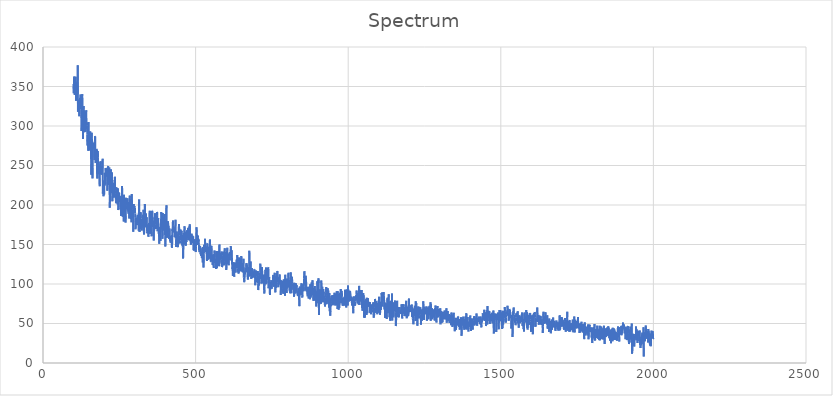
| Category | Spectrum |
|---|---|
| 100.0 | 353.303 |
| 100.69167 | 341.52 |
| 101.38332 | 352.706 |
| 102.07499 | 362.656 |
| 102.76665 | 359.975 |
| 103.45832 | 347.76 |
| 104.14998 | 339.118 |
| 104.84164 | 349.509 |
| 105.53331 | 344.455 |
| 106.22498 | 345.254 |
| 106.91663 | 362.371 |
| 107.6083 | 357.307 |
| 108.29996 | 332.029 |
| 108.99163 | 354.724 |
| 109.68329 | 350.993 |
| 110.37495 | 346.092 |
| 111.06662 | 334.227 |
| 111.75829 | 342.522 |
| 112.44994 | 355.338 |
| 113.14161 | 340.088 |
| 113.83327 | 376.787 |
| 114.52493 | 317.921 |
| 115.2166 | 326.232 |
| 115.90826 | 329.995 |
| 116.59993 | 324.362 |
| 117.29159 | 332.175 |
| 117.98325 | 332.549 |
| 118.67492 | 312.316 |
| 119.36658 | 332.996 |
| 120.05824 | 333.973 |
| 120.74991 | 332.07 |
| 121.44157 | 335.581 |
| 122.13324 | 321.367 |
| 122.8249 | 339.925 |
| 123.51656 | 328.042 |
| 124.20823 | 332.944 |
| 124.89989 | 332.349 |
| 125.59155 | 314.992 |
| 126.28322 | 293.777 |
| 126.97488 | 303.907 |
| 127.66654 | 330.435 |
| 128.35822 | 340.341 |
| 129.04987 | 335.418 |
| 129.74153 | 319.316 |
| 130.4332 | 298.427 |
| 131.12486 | 283.562 |
| 131.81653 | 304.707 |
| 132.50819 | 317.986 |
| 133.19986 | 325.163 |
| 133.89153 | 320.893 |
| 134.58318 | 305.581 |
| 135.27484 | 292.055 |
| 135.96651 | 313.554 |
| 136.65817 | 304.524 |
| 137.34984 | 315.692 |
| 138.0415 | 317.598 |
| 138.73317 | 304.889 |
| 139.42482 | 292.693 |
| 140.11649 | 303.266 |
| 140.80815 | 312.949 |
| 141.49982 | 320.042 |
| 142.19148 | 309.09 |
| 142.88315 | 302.558 |
| 143.57481 | 304.409 |
| 144.26648 | 301.077 |
| 144.95813 | 289.692 |
| 145.6498 | 275.315 |
| 146.34146 | 284.23 |
| 147.03313 | 288.501 |
| 147.72479 | 275.934 |
| 148.41646 | 268.559 |
| 149.10812 | 305.114 |
| 149.79977 | 277.972 |
| 150.49144 | 269.382 |
| 151.18311 | 279.645 |
| 151.87477 | 283.037 |
| 152.56644 | 284.113 |
| 153.2581 | 292.775 |
| 153.94977 | 276.847 |
| 154.64143 | 292.975 |
| 155.33308 | 283.051 |
| 156.02475 | 268.773 |
| 156.71642 | 271.012 |
| 157.40808 | 271.835 |
| 158.09975 | 238.405 |
| 158.79141 | 260.489 |
| 159.48308 | 291.464 |
| 160.17474 | 284.385 |
| 160.86639 | 273.737 |
| 161.55806 | 253.786 |
| 162.24973 | 233.705 |
| 162.94139 | 272.681 |
| 163.63306 | 274.381 |
| 164.32472 | 277.166 |
| 165.01639 | 278.952 |
| 165.70804 | 275.189 |
| 166.3997 | 271.54 |
| 167.09137 | 274.614 |
| 167.78304 | 272.403 |
| 168.4747 | 257.09 |
| 169.16637 | 273.044 |
| 169.85803 | 280.006 |
| 170.5497 | 287.171 |
| 171.24135 | 286.665 |
| 171.93301 | 254.77 |
| 172.62468 | 253.066 |
| 173.31635 | 271.008 |
| 174.00801 | 267.34 |
| 174.69968 | 260.438 |
| 175.39134 | 262.046 |
| 176.08299 | 270.467 |
| 176.77466 | 270.267 |
| 177.46632 | 233.635 |
| 178.15799 | 243.855 |
| 178.84966 | 261.515 |
| 179.54132 | 268.319 |
| 180.23299 | 260.422 |
| 180.92465 | 245.741 |
| 181.6163 | 238.806 |
| 182.30797 | 254.654 |
| 182.99963 | 250.144 |
| 183.6913 | 241.714 |
| 184.38297 | 236.656 |
| 185.07463 | 230.942 |
| 185.7663 | 223.869 |
| 186.45795 | 241.182 |
| 187.14961 | 251.051 |
| 187.84128 | 239.566 |
| 188.53294 | 250.13 |
| 189.22461 | 255.297 |
| 189.91628 | 246.716 |
| 190.60794 | 245.174 |
| 191.29961 | 240.051 |
| 191.99126 | 245.925 |
| 192.68292 | 238.29 |
| 193.37459 | 241.778 |
| 194.06625 | 244.702 |
| 194.75792 | 246.91 |
| 195.44958 | 258.45 |
| 196.14125 | 214.389 |
| 196.8329 | 230.401 |
| 197.52457 | 222.381 |
| 198.21623 | 211.073 |
| 198.9079 | 215.067 |
| 199.59956 | 224.515 |
| 200.29123 | 213.19 |
| 200.98289 | 231.169 |
| 201.67456 | 224.306 |
| 202.36621 | 240.705 |
| 203.05788 | 237.134 |
| 203.74954 | 226 |
| 204.44121 | 231.036 |
| 205.13287 | 246.959 |
| 205.82454 | 246.588 |
| 206.5162 | 236.062 |
| 207.20787 | 236.889 |
| 207.89952 | 244.298 |
| 208.59119 | 246.546 |
| 209.28285 | 242.973 |
| 209.97452 | 244.732 |
| 210.66618 | 218.182 |
| 211.35785 | 222.205 |
| 212.04951 | 238.441 |
| 212.74117 | 249.121 |
| 213.43283 | 249.358 |
| 214.1245 | 240.064 |
| 214.81616 | 225.343 |
| 215.50783 | 237.843 |
| 216.19949 | 226.454 |
| 216.89116 | 247.53 |
| 217.58282 | 244.371 |
| 218.27448 | 213.757 |
| 218.96614 | 196.404 |
| 219.65781 | 226.33 |
| 220.34947 | 215.55 |
| 221.04114 | 223.15 |
| 221.7328 | 240.503 |
| 222.42447 | 245.107 |
| 223.11612 | 242.176 |
| 223.80779 | 239.314 |
| 224.49945 | 232.239 |
| 225.19112 | 229.663 |
| 225.88278 | 241.151 |
| 226.57445 | 211.961 |
| 227.26611 | 204.667 |
| 227.95778 | 210.973 |
| 228.64943 | 216.193 |
| 229.34109 | 227.37 |
| 230.03276 | 216.189 |
| 230.72443 | 227.825 |
| 231.41609 | 227.886 |
| 232.10776 | 211.495 |
| 232.79942 | 209.358 |
| 233.49107 | 225.14 |
| 234.18274 | 231.339 |
| 234.8744 | 230.043 |
| 235.56607 | 235.696 |
| 236.25774 | 218.674 |
| 236.9494 | 214.102 |
| 237.64107 | 211.963 |
| 238.33273 | 207.256 |
| 239.02438 | 205.707 |
| 239.71605 | 202.35 |
| 240.40771 | 222.538 |
| 241.09938 | 208.355 |
| 241.79105 | 205.824 |
| 242.48271 | 203.934 |
| 243.17438 | 204.982 |
| 243.86604 | 211.395 |
| 244.55769 | 200.559 |
| 245.24936 | 221.252 |
| 245.94102 | 212.395 |
| 246.63269 | 193.553 |
| 247.32436 | 197.344 |
| 248.01602 | 206.575 |
| 248.70769 | 205.786 |
| 249.39934 | 215.693 |
| 250.091 | 213.104 |
| 250.78267 | 209.329 |
| 251.47433 | 207.484 |
| 252.166 | 203.434 |
| 252.85767 | 207.849 |
| 253.54933 | 210.975 |
| 254.241 | 194.444 |
| 254.93265 | 202.845 |
| 255.62431 | 186.062 |
| 256.31598 | 210.04 |
| 257.00766 | 199.794 |
| 257.69931 | 192.588 |
| 258.39096 | 208.4 |
| 259.08264 | 224.164 |
| 259.77429 | 213.311 |
| 260.46597 | 202.565 |
| 261.15762 | 185.1 |
| 261.8493 | 193.82 |
| 262.54095 | 202.028 |
| 263.2326 | 204.896 |
| 263.92429 | 199.952 |
| 264.61594 | 179.242 |
| 265.30762 | 212.975 |
| 265.99927 | 195.183 |
| 266.69095 | 191.168 |
| 267.3826 | 198.4 |
| 268.07425 | 201.389 |
| 268.76593 | 200.581 |
| 269.45758 | 201.731 |
| 270.14926 | 177.711 |
| 270.84091 | 181.549 |
| 271.53259 | 209.173 |
| 272.22424 | 206.845 |
| 272.91589 | 204.545 |
| 273.60757 | 205.818 |
| 274.29922 | 199.524 |
| 274.99091 | 194.704 |
| 275.68256 | 195.946 |
| 276.37424 | 208.446 |
| 277.06589 | 199.554 |
| 277.75757 | 193.121 |
| 278.44922 | 200.18 |
| 279.14087 | 203.716 |
| 279.83255 | 188.95 |
| 280.5242 | 200.664 |
| 281.21588 | 191.606 |
| 281.90753 | 195.507 |
| 282.59921 | 183.025 |
| 283.29086 | 195.131 |
| 283.98251 | 211.868 |
| 284.67419 | 200.932 |
| 285.36584 | 184.605 |
| 286.05753 | 197.638 |
| 286.74918 | 207.282 |
| 287.44086 | 193.742 |
| 288.13251 | 182.011 |
| 288.82416 | 182.045 |
| 289.51584 | 181.453 |
| 290.20749 | 178.083 |
| 290.89917 | 213.881 |
| 291.59082 | 196.508 |
| 292.2825 | 195 |
| 292.97415 | 194.337 |
| 293.6658 | 185.243 |
| 294.35748 | 188.03 |
| 295.04913 | 192.421 |
| 295.74081 | 166.177 |
| 296.43246 | 188.169 |
| 297.12415 | 201.225 |
| 297.8158 | 194.735 |
| 298.50748 | 190.488 |
| 299.19913 | 196.665 |
| 299.89078 | 198.775 |
| 300.58246 | 191.296 |
| 301.27411 | 196.178 |
| 301.96579 | 189.209 |
| 302.65744 | 184.414 |
| 303.34912 | 169.264 |
| 304.04077 | 177.059 |
| 304.73242 | 184.02 |
| 305.4241 | 180.343 |
| 306.11575 | 179.913 |
| 306.80743 | 182.89 |
| 307.49908 | 174.549 |
| 308.19077 | 176.906 |
| 308.88242 | 184.426 |
| 309.57407 | 187.567 |
| 310.26575 | 187.323 |
| 310.9574 | 186.094 |
| 311.64908 | 182.785 |
| 312.34073 | 177.211 |
| 313.03241 | 181.197 |
| 313.72406 | 167.335 |
| 314.41574 | 204.026 |
| 315.10739 | 207.104 |
| 315.79904 | 180.963 |
| 316.49072 | 165.844 |
| 317.18237 | 168.772 |
| 317.87405 | 173.556 |
| 318.5657 | 191.025 |
| 319.25739 | 183.714 |
| 319.94904 | 190.428 |
| 320.64069 | 183.585 |
| 321.33237 | 169.975 |
| 322.02402 | 169.914 |
| 322.7157 | 178.714 |
| 323.40735 | 167.77 |
| 324.09903 | 179.135 |
| 324.79068 | 178.605 |
| 325.48233 | 173.254 |
| 326.17401 | 173.646 |
| 326.86566 | 181 |
| 327.55734 | 187.738 |
| 328.24899 | 184.765 |
| 328.94067 | 170.855 |
| 329.63232 | 193.984 |
| 330.32397 | 166.991 |
| 331.01566 | 162.657 |
| 331.70731 | 165.789 |
| 332.39899 | 174.731 |
| 333.09064 | 192.502 |
| 333.78232 | 201.36 |
| 334.47397 | 187.587 |
| 335.16565 | 188.842 |
| 335.8573 | 171.833 |
| 336.54895 | 182.856 |
| 337.24063 | 189.196 |
| 337.93228 | 182.03 |
| 338.62396 | 176.611 |
| 339.31561 | 181.579 |
| 340.00729 | 184.552 |
| 340.69894 | 166.144 |
| 341.39059 | 164.439 |
| 342.08228 | 164.198 |
| 342.77393 | 169.817 |
| 343.46561 | 175.406 |
| 344.15726 | 172.317 |
| 344.84894 | 162.358 |
| 345.54059 | 159.754 |
| 346.23224 | 177.301 |
| 346.92392 | 168.355 |
| 347.61557 | 168.917 |
| 348.30725 | 171.899 |
| 348.9989 | 187.279 |
| 349.69058 | 192.751 |
| 350.38223 | 163.536 |
| 351.07391 | 175.711 |
| 351.76556 | 186.261 |
| 352.45721 | 192.363 |
| 353.1489 | 181.358 |
| 353.84055 | 190.335 |
| 354.53223 | 185.182 |
| 355.22388 | 162.221 |
| 355.91556 | 160.433 |
| 356.60721 | 183.498 |
| 357.29886 | 192.668 |
| 357.99054 | 192.633 |
| 358.68219 | 190.703 |
| 359.37387 | 177.891 |
| 360.06552 | 172.217 |
| 360.7572 | 176.029 |
| 361.44885 | 179.652 |
| 362.1405 | 179.516 |
| 362.83218 | 155.078 |
| 363.52383 | 171.814 |
| 364.21552 | 167.88 |
| 364.90717 | 183.414 |
| 365.59885 | 184.362 |
| 366.2905 | 182.433 |
| 366.98215 | 189.566 |
| 367.67383 | 184.829 |
| 368.36548 | 179.244 |
| 369.05716 | 183.647 |
| 369.74881 | 175.55 |
| 370.44049 | 169.717 |
| 371.13214 | 172.907 |
| 371.82382 | 178.125 |
| 372.51547 | 183.688 |
| 373.20712 | 191.123 |
| 373.8988 | 191.074 |
| 374.59045 | 186.662 |
| 375.28214 | 166.73 |
| 375.97379 | 168.782 |
| 376.66547 | 179.615 |
| 377.35712 | 183.474 |
| 378.04877 | 177.699 |
| 378.74045 | 168.537 |
| 379.4321 | 163.559 |
| 380.12378 | 171.102 |
| 380.81543 | 150.81 |
| 381.50711 | 166.701 |
| 382.19876 | 166.876 |
| 382.89041 | 171.846 |
| 383.58209 | 172.01 |
| 384.27374 | 161.476 |
| 384.96542 | 154.551 |
| 385.65707 | 163.327 |
| 386.34875 | 178.356 |
| 387.04041 | 183.303 |
| 387.73209 | 191.225 |
| 388.42374 | 176.946 |
| 389.11539 | 169.363 |
| 389.80707 | 170.186 |
| 390.49872 | 168.416 |
| 391.1904 | 164.883 |
| 391.88205 | 157.231 |
| 392.57373 | 189.975 |
| 393.26538 | 172.924 |
| 393.95703 | 169.714 |
| 394.64871 | 171.799 |
| 395.34036 | 169.884 |
| 396.03204 | 167.835 |
| 396.72369 | 173.713 |
| 397.41537 | 184.567 |
| 398.10703 | 184.684 |
| 398.79868 | 188.606 |
| 399.49036 | 179.888 |
| 400.18201 | 161.174 |
| 400.87369 | 147.559 |
| 401.56534 | 152.54 |
| 402.25702 | 170.814 |
| 402.94867 | 178.45 |
| 403.64032 | 164.11 |
| 404.332 | 199.534 |
| 405.02365 | 164.512 |
| 405.71533 | 172.365 |
| 406.40698 | 158.56 |
| 407.09866 | 166.21 |
| 407.79031 | 178.266 |
| 408.48199 | 174.261 |
| 409.17365 | 172.732 |
| 409.8653 | 179.481 |
| 410.55698 | 165.28 |
| 411.24863 | 173.702 |
| 411.94031 | 165.147 |
| 412.63196 | 156.834 |
| 413.32364 | 157.736 |
| 414.01529 | 166.295 |
| 414.70694 | 170.304 |
| 415.39862 | 161.227 |
| 416.09027 | 154 |
| 416.78195 | 154 |
| 417.4736 | 160.526 |
| 418.16528 | 152.128 |
| 418.85693 | 155.121 |
| 419.54858 | 159.096 |
| 420.24026 | 160.166 |
| 420.93192 | 161.613 |
| 421.6236 | 159.586 |
| 422.31525 | 145.774 |
| 423.00693 | 147.938 |
| 423.69858 | 169.224 |
| 424.39026 | 167.293 |
| 425.08191 | 174.849 |
| 425.77356 | 180.302 |
| 426.46524 | 173.803 |
| 427.15689 | 165.641 |
| 427.84857 | 167.392 |
| 428.54022 | 165.61 |
| 429.2319 | 171.457 |
| 429.92355 | 170.198 |
| 430.6152 | 170 |
| 431.30688 | 159.224 |
| 431.99854 | 161.216 |
| 432.69022 | 161.637 |
| 433.38187 | 165.152 |
| 434.07355 | 181.431 |
| 434.7652 | 157.842 |
| 435.45685 | 156.554 |
| 436.14853 | 146.739 |
| 436.84018 | 149.832 |
| 437.53186 | 162.206 |
| 438.22351 | 166.431 |
| 438.91519 | 160.71 |
| 439.60684 | 158.87 |
| 440.29849 | 163.45 |
| 440.99017 | 154.476 |
| 441.68182 | 147.539 |
| 442.3735 | 146.647 |
| 443.06516 | 153.07 |
| 443.75684 | 165.464 |
| 444.44849 | 165.209 |
| 445.14017 | 172.32 |
| 445.83182 | 175.912 |
| 446.52347 | 161.073 |
| 447.21515 | 152 |
| 447.9068 | 152.1 |
| 448.59848 | 153.501 |
| 449.29013 | 151.382 |
| 449.98181 | 155.145 |
| 450.67346 | 168.978 |
| 451.36511 | 165.881 |
| 452.05679 | 159.983 |
| 452.74844 | 160.798 |
| 453.44012 | 156.913 |
| 454.13177 | 167.35 |
| 454.82346 | 165.535 |
| 455.51511 | 154.286 |
| 456.20676 | 148.697 |
| 456.89844 | 159.934 |
| 457.59009 | 161.164 |
| 458.28177 | 146.349 |
| 458.97342 | 132.24 |
| 459.6651 | 136.026 |
| 460.35675 | 154.194 |
| 461.04843 | 162.682 |
| 461.74008 | 164.474 |
| 462.43173 | 150.987 |
| 463.12341 | 168.254 |
| 463.81506 | 173.079 |
| 464.50674 | 167.709 |
| 465.19839 | 162.516 |
| 465.89008 | 155.455 |
| 466.58173 | 149.273 |
| 467.27338 | 162.067 |
| 467.96506 | 148.312 |
| 468.65671 | 164.051 |
| 469.34839 | 165.918 |
| 470.04004 | 153.256 |
| 470.73172 | 155.255 |
| 471.42337 | 165.016 |
| 472.11502 | 168.006 |
| 472.8067 | 164.872 |
| 473.49835 | 163.104 |
| 474.19003 | 158.276 |
| 474.88168 | 170.832 |
| 475.57336 | 171 |
| 476.26501 | 155.76 |
| 476.95667 | 157.702 |
| 477.64835 | 164.625 |
| 478.34 | 162.786 |
| 479.03168 | 166.608 |
| 479.72333 | 173.041 |
| 480.41501 | 155.063 |
| 481.10666 | 175.49 |
| 481.79834 | 162.006 |
| 482.48999 | 157.223 |
| 483.18164 | 155.364 |
| 483.87332 | 152.332 |
| 484.56497 | 149.622 |
| 485.25665 | 152.962 |
| 485.9483 | 160.191 |
| 486.63998 | 163.736 |
| 487.33163 | 161.783 |
| 488.02328 | 155.949 |
| 488.71497 | 161.349 |
| 489.40662 | 155.895 |
| 490.0983 | 151.614 |
| 490.78995 | 158.815 |
| 491.48163 | 160.183 |
| 492.17328 | 160.32 |
| 492.86493 | 154.459 |
| 493.55661 | 142.75 |
| 494.24826 | 149.979 |
| 494.93994 | 142.401 |
| 495.63159 | 147.807 |
| 496.32327 | 151.969 |
| 497.01492 | 156.752 |
| 497.7066 | 143.898 |
| 498.39825 | 146.74 |
| 499.0899 | 154 |
| 499.78159 | 147.983 |
| 500.47324 | 140.38 |
| 501.16492 | 147.465 |
| 501.85657 | 152.708 |
| 502.54825 | 165.336 |
| 503.2399 | 171.767 |
| 503.93155 | 154.788 |
| 504.62323 | 162.423 |
| 505.31488 | 153.185 |
| 506.00656 | 149.223 |
| 506.69821 | 158.126 |
| 507.38989 | 161.399 |
| 508.08154 | 158.895 |
| 508.77319 | 154.507 |
| 509.46487 | 154.024 |
| 510.15652 | 156.342 |
| 510.84821 | 150.395 |
| 511.53986 | 142.209 |
| 512.23151 | 141.708 |
| 512.92322 | 140.364 |
| 513.61487 | 142.74 |
| 514.30652 | 148.186 |
| 514.99817 | 147.044 |
| 515.68982 | 147 |
| 516.38153 | 137.68 |
| 517.07318 | 139.883 |
| 517.76483 | 135.719 |
| 518.45648 | 141.515 |
| 519.14813 | 135.588 |
| 519.83984 | 136.376 |
| 520.53149 | 132.869 |
| 521.22314 | 133.363 |
| 521.91479 | 145.29 |
| 522.60651 | 137.956 |
| 523.29816 | 127.119 |
| 523.98981 | 146.981 |
| 524.68146 | 134.819 |
| 525.37311 | 137.171 |
| 526.06482 | 120.748 |
| 526.75647 | 139.332 |
| 527.44812 | 149.79 |
| 528.13977 | 144.008 |
| 528.83148 | 141.852 |
| 529.52313 | 140.57 |
| 530.21478 | 140.761 |
| 530.90643 | 157.312 |
| 531.59808 | 147.343 |
| 532.28979 | 144.868 |
| 532.98145 | 144.906 |
| 533.6731 | 140.559 |
| 534.36475 | 141.813 |
| 535.0564 | 147.316 |
| 535.74811 | 144.793 |
| 536.43976 | 132.734 |
| 537.13141 | 129.203 |
| 537.82306 | 145.945 |
| 538.51477 | 151.43 |
| 539.20642 | 139.227 |
| 539.89807 | 130.84 |
| 540.58972 | 130.666 |
| 541.28137 | 138.134 |
| 541.97308 | 132.229 |
| 542.66473 | 138.083 |
| 543.35638 | 147.221 |
| 544.04803 | 139.708 |
| 544.73975 | 134.786 |
| 545.4314 | 132.51 |
| 546.12305 | 136.799 |
| 546.8147 | 156.395 |
| 547.50635 | 140.46 |
| 548.19806 | 131.777 |
| 548.88971 | 132.023 |
| 549.58136 | 128.328 |
| 550.27301 | 128.242 |
| 550.96466 | 137.388 |
| 551.65637 | 148.196 |
| 552.34802 | 148.522 |
| 553.03967 | 133.209 |
| 553.73132 | 134.39 |
| 554.42303 | 130.747 |
| 555.11469 | 134.401 |
| 555.80634 | 124.14 |
| 556.49799 | 130.616 |
| 557.18964 | 137.392 |
| 557.88135 | 136.456 |
| 558.573 | 127.944 |
| 559.26465 | 120.373 |
| 559.9563 | 125.884 |
| 560.64795 | 137.316 |
| 561.33966 | 134.153 |
| 562.03131 | 142.36 |
| 562.72296 | 135.84 |
| 563.41461 | 129.846 |
| 564.10632 | 129.994 |
| 564.79797 | 129.316 |
| 565.48962 | 130.412 |
| 566.18127 | 126.605 |
| 566.87292 | 118.913 |
| 567.56464 | 124.305 |
| 568.25629 | 141.77 |
| 568.94794 | 133.698 |
| 569.63959 | 130.833 |
| 570.3313 | 119.876 |
| 571.02295 | 134.126 |
| 571.7146 | 126.46 |
| 572.40625 | 126.996 |
| 573.0979 | 141.5 |
| 573.78961 | 136.476 |
| 574.48126 | 123.452 |
| 575.17291 | 129.879 |
| 575.86456 | 135.945 |
| 576.55621 | 125.19 |
| 577.24792 | 122.466 |
| 577.93958 | 149.896 |
| 578.63123 | 125.976 |
| 579.32288 | 139.131 |
| 580.01459 | 134.034 |
| 580.70624 | 135.019 |
| 581.39789 | 132.61 |
| 582.08954 | 130.632 |
| 582.78119 | 135.122 |
| 583.4729 | 138.102 |
| 584.16455 | 138.182 |
| 584.8562 | 141.162 |
| 585.54785 | 131.111 |
| 586.23956 | 121.437 |
| 586.93121 | 121.496 |
| 587.62286 | 121.567 |
| 588.31451 | 132.864 |
| 589.00616 | 136.322 |
| 589.69788 | 137.185 |
| 590.38953 | 140.845 |
| 591.08118 | 138.362 |
| 591.77283 | 127.838 |
| 592.46448 | 123.86 |
| 593.15619 | 124.826 |
| 593.84784 | 123.78 |
| 594.53949 | 128.761 |
| 595.23114 | 145.207 |
| 595.92285 | 140.458 |
| 596.6145 | 128.656 |
| 597.30615 | 128.591 |
| 597.9978 | 126.423 |
| 598.68945 | 126.714 |
| 599.38116 | 134.22 |
| 600.07281 | 131.152 |
| 600.76447 | 117.855 |
| 601.45612 | 133.038 |
| 602.14783 | 129.692 |
| 602.83948 | 131.926 |
| 603.53113 | 145.818 |
| 604.22278 | 126.937 |
| 604.91443 | 138.687 |
| 605.60614 | 132.47 |
| 606.29779 | 125.003 |
| 606.98944 | 130.839 |
| 607.68109 | 130.107 |
| 608.37274 | 123.821 |
| 609.06445 | 134.858 |
| 609.7561 | 137.797 |
| 610.44775 | 138.28 |
| 611.1394 | 130.005 |
| 611.83112 | 140.64 |
| 612.52277 | 136.525 |
| 613.21442 | 137.088 |
| 613.90607 | 139.223 |
| 614.59772 | 142.144 |
| 615.28943 | 147.965 |
| 615.98108 | 145.618 |
| 616.67273 | 132.645 |
| 617.36438 | 129.838 |
| 618.05609 | 142.612 |
| 618.74774 | 134.119 |
| 619.43939 | 127.581 |
| 620.13104 | 119.285 |
| 620.82269 | 120.778 |
| 621.5144 | 115.323 |
| 622.20605 | 110.017 |
| 622.89771 | 121.658 |
| 623.58936 | 127.414 |
| 624.28101 | 121.579 |
| 624.97272 | 121.617 |
| 625.66437 | 119.312 |
| 626.35602 | 109.117 |
| 627.04767 | 127.097 |
| 627.73938 | 114.945 |
| 628.43103 | 118.052 |
| 629.12268 | 119.499 |
| 629.81433 | 125.717 |
| 630.50598 | 120.955 |
| 631.19769 | 114.491 |
| 631.88934 | 120.353 |
| 632.58099 | 126.854 |
| 633.27264 | 125.597 |
| 633.96429 | 128.432 |
| 634.65601 | 130.885 |
| 635.34766 | 120.418 |
| 636.03931 | 124.798 |
| 636.73096 | 136.787 |
| 637.42267 | 122.944 |
| 638.11432 | 121.62 |
| 638.80597 | 119.791 |
| 639.49762 | 114.691 |
| 640.18927 | 119.779 |
| 640.88098 | 113.117 |
| 641.57263 | 113.512 |
| 642.26428 | 128.543 |
| 642.95593 | 133.641 |
| 643.64764 | 124.757 |
| 644.33929 | 121.417 |
| 645.03094 | 117.501 |
| 645.7226 | 115.988 |
| 646.41425 | 130.741 |
| 647.10596 | 127.038 |
| 647.79761 | 125.167 |
| 648.48926 | 132.219 |
| 649.18091 | 118.188 |
| 649.87256 | 135.42 |
| 650.56427 | 127.946 |
| 651.25592 | 118.115 |
| 651.94757 | 115.718 |
| 652.63922 | 115.552 |
| 653.33093 | 119.858 |
| 654.02258 | 120.589 |
| 654.71423 | 124.376 |
| 655.40588 | 126.465 |
| 656.09753 | 114.686 |
| 656.78925 | 131.904 |
| 657.4809 | 119.19 |
| 658.17255 | 108.089 |
| 658.8642 | 105.253 |
| 659.55591 | 102.3 |
| 660.24756 | 106.17 |
| 660.93921 | 109.797 |
| 661.63086 | 113.022 |
| 662.32251 | 116.567 |
| 663.01422 | 117.834 |
| 663.70587 | 120.322 |
| 664.39752 | 119.219 |
| 665.08917 | 117.257 |
| 665.78082 | 114.969 |
| 666.47253 | 126.518 |
| 667.16418 | 120.384 |
| 667.85583 | 124.844 |
| 668.54749 | 117.754 |
| 669.2392 | 117.716 |
| 669.93085 | 113.525 |
| 670.6225 | 107.613 |
| 671.31415 | 105.567 |
| 672.0058 | 110.122 |
| 672.69751 | 114.371 |
| 673.38916 | 112.89 |
| 674.08081 | 121.16 |
| 674.77246 | 109.427 |
| 675.46417 | 114.095 |
| 676.15582 | 142.007 |
| 676.84747 | 112.872 |
| 677.53912 | 117.225 |
| 678.23077 | 118.902 |
| 678.92249 | 111.245 |
| 679.61414 | 114.091 |
| 680.30579 | 128.362 |
| 680.99744 | 122.788 |
| 681.68909 | 109.245 |
| 682.3808 | 106.454 |
| 683.07245 | 107.375 |
| 683.7641 | 119.255 |
| 684.45575 | 110.17 |
| 685.14746 | 120.282 |
| 685.83911 | 107.716 |
| 686.53076 | 113.308 |
| 687.22241 | 108.228 |
| 687.91406 | 114.5 |
| 688.60577 | 108.875 |
| 689.29742 | 111.383 |
| 689.98907 | 115.079 |
| 690.68073 | 111.88 |
| 691.37244 | 112.955 |
| 692.06409 | 118.591 |
| 692.75574 | 118.429 |
| 693.44739 | 115.279 |
| 694.13904 | 114.441 |
| 694.83075 | 111.349 |
| 695.5224 | 98.446 |
| 696.21405 | 113.014 |
| 696.9057 | 113.544 |
| 697.59735 | 117.14 |
| 698.28906 | 109.286 |
| 698.98071 | 108.329 |
| 699.67236 | 104.687 |
| 700.36401 | 104.623 |
| 701.05573 | 102.166 |
| 701.74738 | 109.103 |
| 702.43903 | 108.696 |
| 703.13068 | 103.461 |
| 703.82233 | 116.483 |
| 704.51404 | 110.994 |
| 705.20569 | 92.26 |
| 705.89734 | 99.95 |
| 706.58899 | 99.486 |
| 707.28064 | 98.019 |
| 707.97235 | 108.68 |
| 708.664 | 110.427 |
| 709.35565 | 106.585 |
| 710.0473 | 108.084 |
| 710.73901 | 106.7 |
| 711.43066 | 114.063 |
| 712.12231 | 125.778 |
| 712.81396 | 117.357 |
| 713.50562 | 111.923 |
| 714.19733 | 117.758 |
| 714.88898 | 103.107 |
| 715.58063 | 100.485 |
| 716.27228 | 103.64 |
| 716.96399 | 105.89 |
| 717.65564 | 121.528 |
| 718.34729 | 111.21 |
| 719.03894 | 102.331 |
| 719.73059 | 111.855 |
| 720.4223 | 107.998 |
| 721.11395 | 101.012 |
| 721.8056 | 111.108 |
| 722.49725 | 110.887 |
| 723.1889 | 110.063 |
| 723.88062 | 105.232 |
| 724.57227 | 91.576 |
| 725.26392 | 87.972 |
| 725.95557 | 96.792 |
| 726.64728 | 100.058 |
| 727.33893 | 104.157 |
| 728.03058 | 115.995 |
| 728.72223 | 117.926 |
| 729.41388 | 102.552 |
| 730.10559 | 99.732 |
| 730.79724 | 120.805 |
| 731.48889 | 116.142 |
| 732.18054 | 100.795 |
| 732.87225 | 109.971 |
| 733.5639 | 112.981 |
| 734.25555 | 116.522 |
| 734.9472 | 118.187 |
| 735.63885 | 108.596 |
| 736.33057 | 105.713 |
| 737.02222 | 115.421 |
| 737.71387 | 120.681 |
| 738.40552 | 121.143 |
| 739.09717 | 94.62 |
| 739.78888 | 100.51 |
| 740.48053 | 107.652 |
| 741.17218 | 108.99 |
| 741.86383 | 99.166 |
| 742.55554 | 102.994 |
| 743.24719 | 87.845 |
| 743.93884 | 86.106 |
| 744.63049 | 102.551 |
| 745.32214 | 100.2 |
| 746.01385 | 99.749 |
| 746.70551 | 103.108 |
| 747.39716 | 103.567 |
| 748.08881 | 104.848 |
| 748.78052 | 100.433 |
| 749.47217 | 94.076 |
| 750.16382 | 102.743 |
| 750.85547 | 101.312 |
| 751.54712 | 99.143 |
| 752.23883 | 102.164 |
| 752.93048 | 98.253 |
| 753.62213 | 105.811 |
| 754.31378 | 111.52 |
| 755.00543 | 101.622 |
| 755.69714 | 106.93 |
| 756.38879 | 96.507 |
| 757.08044 | 99.549 |
| 757.77209 | 99.63 |
| 758.46381 | 113.616 |
| 759.15546 | 114.141 |
| 759.84711 | 104.314 |
| 760.53876 | 99.753 |
| 761.23041 | 89.402 |
| 761.92212 | 91.398 |
| 762.61377 | 109.804 |
| 763.30542 | 95.529 |
| 763.99707 | 97.024 |
| 764.68878 | 95.615 |
| 765.38043 | 110.699 |
| 766.07208 | 113.539 |
| 766.76373 | 104.204 |
| 767.45538 | 116.313 |
| 768.14709 | 116.34 |
| 768.83875 | 109.455 |
| 769.5304 | 103.951 |
| 770.22205 | 101.897 |
| 770.9137 | 96.007 |
| 771.60541 | 96.764 |
| 772.29706 | 106.653 |
| 772.98871 | 108.405 |
| 773.68036 | 101.602 |
| 774.37207 | 102.914 |
| 775.06372 | 111.115 |
| 775.75537 | 112.138 |
| 776.44702 | 100.256 |
| 777.13867 | 99.524 |
| 777.83038 | 102.513 |
| 778.52203 | 101.297 |
| 779.21368 | 86.135 |
| 779.90533 | 104.808 |
| 780.59698 | 104.221 |
| 781.2887 | 104.475 |
| 781.98035 | 97.033 |
| 782.672 | 96.474 |
| 783.36365 | 102.489 |
| 784.05536 | 103.729 |
| 784.74701 | 94.553 |
| 785.43866 | 89.637 |
| 786.13031 | 94.445 |
| 786.82196 | 90.308 |
| 787.51367 | 87.646 |
| 788.20532 | 103.58 |
| 788.89697 | 105.7 |
| 789.58862 | 97.413 |
| 790.28033 | 101.176 |
| 790.97198 | 98.172 |
| 791.66364 | 102.436 |
| 792.35529 | 106.166 |
| 793.04694 | 85.245 |
| 793.73865 | 111.849 |
| 794.4303 | 98.805 |
| 795.12195 | 97.478 |
| 795.8136 | 95.98 |
| 796.50525 | 94.822 |
| 797.19696 | 94.567 |
| 797.88861 | 89.655 |
| 798.58026 | 88.664 |
| 799.27191 | 96.183 |
| 799.96362 | 106.86 |
| 800.65527 | 102.52 |
| 801.34692 | 95.752 |
| 802.03857 | 98.848 |
| 802.73022 | 95.744 |
| 803.42194 | 106.954 |
| 804.11359 | 114.123 |
| 804.80524 | 108.578 |
| 805.49689 | 105.541 |
| 806.1886 | 102.381 |
| 806.88025 | 96.794 |
| 807.5719 | 98.43 |
| 808.26355 | 90.704 |
| 808.9552 | 101.393 |
| 809.64691 | 88.407 |
| 810.33856 | 95.039 |
| 811.03021 | 104.405 |
| 811.72186 | 114.718 |
| 812.41351 | 107.763 |
| 813.10522 | 91.107 |
| 813.79688 | 88.246 |
| 814.48853 | 91.622 |
| 815.18018 | 101.455 |
| 815.87189 | 109.216 |
| 816.56354 | 102.972 |
| 817.25519 | 100.194 |
| 817.94684 | 98.649 |
| 818.63849 | 98.646 |
| 819.3302 | 100.109 |
| 820.02185 | 92.609 |
| 820.7135 | 100.176 |
| 821.40515 | 96.224 |
| 822.09686 | 97.525 |
| 822.78851 | 83.918 |
| 823.48016 | 101.474 |
| 824.17181 | 91.343 |
| 824.86346 | 101.002 |
| 825.55518 | 95.124 |
| 826.24683 | 98.986 |
| 826.93848 | 91.071 |
| 827.63013 | 88.064 |
| 828.32178 | 93.24 |
| 829.01349 | 100.788 |
| 829.70514 | 95.605 |
| 830.39679 | 96.324 |
| 831.08844 | 98.641 |
| 831.78015 | 90.478 |
| 832.4718 | 90.885 |
| 833.16345 | 90.39 |
| 833.8551 | 87.708 |
| 834.54675 | 85.359 |
| 835.23846 | 85.03 |
| 835.93011 | 90.907 |
| 836.62177 | 94.572 |
| 837.31342 | 92.788 |
| 838.00513 | 92.46 |
| 838.69678 | 86.269 |
| 839.38843 | 78.125 |
| 840.08008 | 71.969 |
| 840.77173 | 83.009 |
| 841.46344 | 96.682 |
| 842.15509 | 87.315 |
| 842.84674 | 92.055 |
| 843.53839 | 94.218 |
| 844.23004 | 86.977 |
| 844.92175 | 86.32 |
| 845.6134 | 88.979 |
| 846.30505 | 97.524 |
| 846.9967 | 101.023 |
| 847.68842 | 88.942 |
| 848.38007 | 94.333 |
| 849.07172 | 85.938 |
| 849.76337 | 82.798 |
| 850.45502 | 92.762 |
| 851.14673 | 99.559 |
| 851.83838 | 91.392 |
| 852.53003 | 92.229 |
| 853.22168 | 95.742 |
| 853.91333 | 90.837 |
| 854.60504 | 96.809 |
| 855.29669 | 107.005 |
| 855.98834 | 113.864 |
| 856.67999 | 116.158 |
| 857.3717 | 107.132 |
| 858.06335 | 102.096 |
| 858.755 | 108.684 |
| 859.44666 | 101.512 |
| 860.13831 | 92.393 |
| 860.83002 | 110.327 |
| 861.52167 | 105.819 |
| 862.21332 | 102.441 |
| 862.90497 | 91.212 |
| 863.59668 | 93.313 |
| 864.28833 | 90.428 |
| 864.97998 | 92.251 |
| 865.67163 | 94.518 |
| 866.36328 | 85.257 |
| 867.05499 | 84.607 |
| 867.74664 | 91.867 |
| 868.43829 | 96.454 |
| 869.12994 | 94.695 |
| 869.82159 | 83.075 |
| 870.51331 | 81.557 |
| 871.20496 | 91.383 |
| 871.89661 | 86.95 |
| 872.58826 | 84.415 |
| 873.27997 | 87.456 |
| 873.97162 | 88.361 |
| 874.66327 | 80.576 |
| 875.35492 | 99.576 |
| 876.04657 | 90.757 |
| 876.73828 | 92.677 |
| 877.42993 | 82.782 |
| 878.12158 | 90.646 |
| 878.81323 | 84.957 |
| 879.50494 | 87.793 |
| 880.19659 | 102.036 |
| 880.88824 | 91.368 |
| 881.5799 | 90.67 |
| 882.27155 | 90.95 |
| 882.96326 | 104.779 |
| 883.65491 | 99.573 |
| 884.34656 | 85.229 |
| 885.03821 | 84.505 |
| 885.72986 | 80.403 |
| 886.42157 | 78.797 |
| 887.11322 | 91.16 |
| 887.80487 | 95.038 |
| 888.49652 | 89.377 |
| 889.18823 | 83.814 |
| 889.87988 | 79.216 |
| 890.57153 | 97.344 |
| 891.26318 | 86.135 |
| 891.95483 | 83.723 |
| 892.64655 | 88.029 |
| 893.3382 | 81.327 |
| 894.02985 | 91.589 |
| 894.7215 | 81.951 |
| 895.41321 | 71.609 |
| 896.10486 | 85.517 |
| 896.79651 | 75.67 |
| 897.48816 | 78.174 |
| 898.17981 | 89.182 |
| 898.87152 | 103.391 |
| 899.56317 | 83.704 |
| 900.25482 | 86.599 |
| 900.94647 | 98.488 |
| 901.63812 | 104.953 |
| 902.32983 | 101.456 |
| 903.02148 | 107.129 |
| 903.71313 | 73.399 |
| 904.40479 | 60.783 |
| 905.0965 | 86.62 |
| 905.78815 | 81.52 |
| 906.4798 | 79.04 |
| 907.17145 | 85.228 |
| 907.8631 | 93.202 |
| 908.55481 | 92.277 |
| 909.24646 | 91.723 |
| 909.93811 | 85.023 |
| 910.62976 | 75.096 |
| 911.32141 | 81.013 |
| 912.01312 | 104.348 |
| 912.70477 | 84.915 |
| 913.39642 | 87.032 |
| 914.08807 | 87.83 |
| 914.77979 | 96.533 |
| 915.47144 | 80.942 |
| 916.16309 | 85.233 |
| 916.85474 | 86.623 |
| 917.54639 | 76.809 |
| 918.2381 | 93.736 |
| 918.92975 | 78.435 |
| 919.6214 | 90.07 |
| 920.31305 | 81.375 |
| 921.00476 | 84.67 |
| 921.69641 | 80.887 |
| 922.38806 | 81.106 |
| 923.07971 | 79.012 |
| 923.77136 | 71.401 |
| 924.46307 | 78.599 |
| 925.15472 | 82.015 |
| 925.84637 | 79.154 |
| 926.53802 | 82.419 |
| 927.22968 | 89.313 |
| 927.92139 | 96.238 |
| 928.61304 | 85.765 |
| 929.30469 | 75.305 |
| 929.99634 | 74.486 |
| 930.68805 | 83.189 |
| 931.3797 | 77.154 |
| 932.07135 | 84.488 |
| 932.763 | 94.579 |
| 933.45465 | 91.696 |
| 934.14636 | 80.24 |
| 934.83801 | 91.663 |
| 935.52966 | 78.854 |
| 936.22131 | 80.878 |
| 936.91302 | 74.806 |
| 937.60468 | 69.934 |
| 938.29633 | 88.646 |
| 938.98798 | 79.823 |
| 939.67963 | 65.599 |
| 940.37134 | 75.83 |
| 941.06299 | 59.747 |
| 941.75464 | 66.039 |
| 942.44629 | 81.92 |
| 943.13794 | 71.826 |
| 943.82965 | 75.425 |
| 944.5213 | 77.638 |
| 945.21295 | 84.675 |
| 945.9046 | 80.6 |
| 946.59631 | 83.088 |
| 947.28796 | 85.564 |
| 947.97961 | 81.018 |
| 948.67126 | 79.914 |
| 949.36292 | 73.129 |
| 950.05463 | 76.634 |
| 950.74628 | 85.937 |
| 951.43793 | 84.045 |
| 952.12958 | 82.174 |
| 952.82129 | 74.266 |
| 953.51294 | 76.403 |
| 954.20459 | 77.912 |
| 954.89624 | 88.912 |
| 955.58789 | 81.037 |
| 956.2796 | 81.957 |
| 956.97125 | 87.605 |
| 957.6629 | 72.879 |
| 958.35455 | 78 |
| 959.0462 | 77.339 |
| 959.73792 | 73.4 |
| 960.42957 | 77.486 |
| 961.12122 | 85.395 |
| 961.81287 | 80.117 |
| 962.50458 | 90.881 |
| 963.19623 | 78.19 |
| 963.88788 | 72.952 |
| 964.57953 | 85.861 |
| 965.27118 | 68.474 |
| 965.96289 | 90.778 |
| 966.65454 | 76.426 |
| 967.34619 | 87.227 |
| 968.03784 | 70.892 |
| 968.72955 | 67.541 |
| 969.4212 | 85.723 |
| 970.11285 | 78.805 |
| 970.8045 | 69.651 |
| 971.49615 | 79.028 |
| 972.18787 | 87.334 |
| 972.87952 | 87.511 |
| 973.57117 | 88.657 |
| 974.26282 | 81.742 |
| 974.95447 | 87.431 |
| 975.64618 | 93.747 |
| 976.33783 | 79.65 |
| 977.02948 | 75.62 |
| 977.72113 | 84.919 |
| 978.41284 | 91.275 |
| 979.10449 | 89.761 |
| 979.79614 | 84.33 |
| 980.48779 | 83.165 |
| 981.17944 | 76.486 |
| 981.87115 | 72.504 |
| 982.56281 | 79.519 |
| 983.25446 | 81.877 |
| 983.94611 | 76.468 |
| 984.63776 | 73.522 |
| 985.32947 | 73.207 |
| 986.02112 | 76.656 |
| 986.71277 | 83.089 |
| 987.40442 | 76.068 |
| 988.09613 | 72.744 |
| 988.78778 | 76.881 |
| 989.47943 | 92.737 |
| 990.17108 | 77.387 |
| 990.86273 | 79.013 |
| 991.55444 | 73.565 |
| 992.24609 | 72.902 |
| 992.93774 | 81.834 |
| 993.62939 | 70.139 |
| 994.32111 | 92.848 |
| 995.01276 | 87.734 |
| 995.70441 | 86.752 |
| 996.39606 | 83.099 |
| 997.08771 | 85.622 |
| 997.77942 | 93.493 |
| 998.47107 | 72.823 |
| 999.16272 | 98.09 |
| 999.85437 | 89.265 |
| 1000.546 | 93.172 |
| 1001.2377 | 79.546 |
| 1001.9294 | 77.621 |
| 1002.621 | 88.363 |
| 1003.3127 | 78.953 |
| 1004.0044 | 82.844 |
| 1004.696 | 88.007 |
| 1005.3877 | 91.251 |
| 1006.0793 | 91.079 |
| 1006.771 | 89.308 |
| 1007.4627 | 86.639 |
| 1008.1544 | 84.548 |
| 1008.846 | 83.159 |
| 1009.5377 | 78.82 |
| 1010.2294 | 83.932 |
| 1010.921 | 78.499 |
| 1011.6127 | 83.076 |
| 1012.3043 | 72.711 |
| 1012.996 | 74.141 |
| 1013.6877 | 79.804 |
| 1014.3793 | 74.146 |
| 1015.071 | 81.596 |
| 1015.7626 | 75.344 |
| 1016.4543 | 62.882 |
| 1017.146 | 71.353 |
| 1017.8376 | 81.259 |
| 1018.5293 | 84.325 |
| 1019.2209 | 81.866 |
| 1019.9127 | 77.021 |
| 1020.6043 | 73.222 |
| 1021.296 | 72.591 |
| 1021.9876 | 74.877 |
| 1022.6793 | 72.76 |
| 1023.371 | 77.944 |
| 1024.0626 | 83.329 |
| 1024.7543 | 83.564 |
| 1025.4459 | 85.627 |
| 1026.1376 | 79.376 |
| 1026.8292 | 84.084 |
| 1027.5209 | 91.744 |
| 1028.2126 | 89.792 |
| 1028.9043 | 82.682 |
| 1029.5959 | 77.444 |
| 1030.2876 | 77.772 |
| 1030.9792 | 75.265 |
| 1031.6709 | 79.637 |
| 1032.3625 | 88.53 |
| 1033.0542 | 85.222 |
| 1033.7458 | 78.209 |
| 1034.4376 | 73.915 |
| 1035.1293 | 74.733 |
| 1035.8209 | 97.625 |
| 1036.5126 | 87.26 |
| 1037.2042 | 73.398 |
| 1037.8959 | 91.242 |
| 1038.5875 | 92.335 |
| 1039.2792 | 86.772 |
| 1039.9708 | 84.497 |
| 1040.6626 | 81.658 |
| 1041.3542 | 77.904 |
| 1042.0459 | 80.169 |
| 1042.7375 | 82.999 |
| 1043.4292 | 87.953 |
| 1044.1208 | 92.515 |
| 1044.8125 | 85.363 |
| 1045.5042 | 69.893 |
| 1046.1958 | 79.676 |
| 1046.8876 | 66.05 |
| 1047.5792 | 76.614 |
| 1048.2709 | 74.056 |
| 1048.9625 | 88.569 |
| 1049.6542 | 74.552 |
| 1050.3458 | 86.417 |
| 1051.0375 | 80.369 |
| 1051.7291 | 57.453 |
| 1052.4208 | 78.366 |
| 1053.1124 | 68.921 |
| 1053.8042 | 70.513 |
| 1054.4958 | 57.352 |
| 1055.1875 | 65.011 |
| 1055.8792 | 61.301 |
| 1056.5708 | 77.6 |
| 1057.2625 | 80.625 |
| 1057.9541 | 76.6 |
| 1058.6458 | 69.931 |
| 1059.3374 | 71.581 |
| 1060.0292 | 60.677 |
| 1060.7208 | 82.485 |
| 1061.4125 | 73.277 |
| 1062.1041 | 65.101 |
| 1062.7958 | 62.956 |
| 1063.4874 | 75.334 |
| 1064.1791 | 74.512 |
| 1064.8707 | 82.094 |
| 1065.5624 | 73.487 |
| 1066.2542 | 75.614 |
| 1066.9458 | 71.157 |
| 1067.6375 | 73.913 |
| 1068.3291 | 77.367 |
| 1069.0208 | 72.509 |
| 1069.7124 | 72.36 |
| 1070.4041 | 71.969 |
| 1071.0957 | 77.139 |
| 1071.7874 | 64.933 |
| 1072.4791 | 63.23 |
| 1073.1708 | 72.916 |
| 1073.8624 | 69.897 |
| 1074.5541 | 61.798 |
| 1075.2457 | 74.155 |
| 1075.9374 | 73.594 |
| 1076.629 | 66.744 |
| 1077.3207 | 67.217 |
| 1078.0123 | 64.32 |
| 1078.7041 | 67.942 |
| 1079.3958 | 68.283 |
| 1080.0874 | 73.754 |
| 1080.7791 | 74.55 |
| 1081.4707 | 71.83 |
| 1082.1624 | 76.768 |
| 1082.854 | 68.223 |
| 1083.5457 | 57.363 |
| 1084.2373 | 62.611 |
| 1084.929 | 60.223 |
| 1085.6207 | 70.632 |
| 1086.3124 | 71.482 |
| 1087.004 | 71.163 |
| 1087.6957 | 81.131 |
| 1088.3873 | 79.867 |
| 1089.079 | 70.68 |
| 1089.7706 | 77.796 |
| 1090.4623 | 63.676 |
| 1091.1539 | 71.489 |
| 1091.8457 | 72.189 |
| 1092.5374 | 78.186 |
| 1093.229 | 75.592 |
| 1093.9207 | 68.076 |
| 1094.6123 | 75.853 |
| 1095.304 | 61.679 |
| 1095.9956 | 68.801 |
| 1096.6873 | 75.525 |
| 1097.3789 | 73.807 |
| 1098.0707 | 63.811 |
| 1098.7623 | 68.308 |
| 1099.454 | 73.162 |
| 1100.1456 | 75.165 |
| 1100.8373 | 83.75 |
| 1101.5289 | 69.892 |
| 1102.2206 | 72.294 |
| 1102.9122 | 63.109 |
| 1103.6039 | 69.489 |
| 1104.2957 | 61.031 |
| 1104.9873 | 66.834 |
| 1105.679 | 77.521 |
| 1106.3706 | 71.273 |
| 1107.0623 | 67.084 |
| 1107.7539 | 75.715 |
| 1108.4456 | 81.017 |
| 1109.1372 | 88.389 |
| 1109.8289 | 86.489 |
| 1110.5205 | 89.273 |
| 1111.2123 | 87.198 |
| 1111.9039 | 71.535 |
| 1112.5956 | 72.978 |
| 1113.2872 | 79.355 |
| 1113.9789 | 82.463 |
| 1114.6705 | 78.404 |
| 1115.3622 | 79.114 |
| 1116.0538 | 89.816 |
| 1116.7455 | 84.951 |
| 1117.4373 | 83.527 |
| 1118.1289 | 74.494 |
| 1118.8206 | 67.835 |
| 1119.5122 | 76.519 |
| 1120.2039 | 71.57 |
| 1120.8955 | 57.025 |
| 1121.5872 | 68.64 |
| 1122.2788 | 62.174 |
| 1122.9705 | 75.663 |
| 1123.6622 | 72.976 |
| 1124.3539 | 64.434 |
| 1125.0455 | 71.419 |
| 1125.7372 | 62.823 |
| 1126.4288 | 55.655 |
| 1127.1205 | 74.538 |
| 1127.8121 | 73.63 |
| 1128.5038 | 82.611 |
| 1129.1954 | 66.165 |
| 1129.8872 | 63.084 |
| 1130.5789 | 73.501 |
| 1131.2705 | 65.962 |
| 1131.9622 | 74.76 |
| 1132.6538 | 86.967 |
| 1133.3455 | 71.383 |
| 1134.0371 | 69.762 |
| 1134.7288 | 73.502 |
| 1135.4204 | 57.884 |
| 1136.1122 | 77.771 |
| 1136.8038 | 66.468 |
| 1137.4955 | 53.373 |
| 1138.1871 | 67.444 |
| 1138.8788 | 57.853 |
| 1139.5704 | 65.981 |
| 1140.2621 | 78.863 |
| 1140.9537 | 57.131 |
| 1141.6454 | 65.798 |
| 1142.337 | 67.923 |
| 1143.0288 | 66.792 |
| 1143.7205 | 88.065 |
| 1144.4121 | 53.742 |
| 1145.1038 | 65.145 |
| 1145.7954 | 66.672 |
| 1146.4871 | 63.275 |
| 1147.1787 | 67.335 |
| 1147.8704 | 76.633 |
| 1148.562 | 57.877 |
| 1149.2538 | 58.744 |
| 1149.9454 | 70.396 |
| 1150.6371 | 71.699 |
| 1151.3287 | 67.29 |
| 1152.0204 | 73.967 |
| 1152.712 | 76.27 |
| 1153.4037 | 78.995 |
| 1154.0953 | 69.691 |
| 1154.787 | 74.435 |
| 1155.4788 | 64.299 |
| 1156.1704 | 46.711 |
| 1156.8621 | 48.026 |
| 1157.5537 | 71.814 |
| 1158.2454 | 71.15 |
| 1158.937 | 66.264 |
| 1159.6287 | 66.609 |
| 1160.3203 | 78.791 |
| 1161.012 | 70.33 |
| 1161.7037 | 70.379 |
| 1162.3954 | 69.988 |
| 1163.087 | 58.374 |
| 1163.7787 | 65.093 |
| 1164.4703 | 70.841 |
| 1165.162 | 60.031 |
| 1165.8536 | 57.707 |
| 1166.5453 | 60.796 |
| 1167.2369 | 62.334 |
| 1167.9286 | 67.589 |
| 1168.6204 | 70.72 |
| 1169.312 | 67.883 |
| 1170.0037 | 66.164 |
| 1170.6953 | 64.999 |
| 1171.387 | 62.005 |
| 1172.0786 | 65.302 |
| 1172.7703 | 65.171 |
| 1173.4619 | 64.744 |
| 1174.1536 | 67.763 |
| 1174.8453 | 74.237 |
| 1175.537 | 69.85 |
| 1176.2286 | 61.352 |
| 1176.9203 | 56.333 |
| 1177.6119 | 63.875 |
| 1178.3036 | 66.423 |
| 1178.9952 | 74.517 |
| 1179.6869 | 66.093 |
| 1180.3785 | 62.493 |
| 1181.0703 | 72.691 |
| 1181.762 | 74.18 |
| 1182.4536 | 71.346 |
| 1183.1453 | 64.21 |
| 1183.8369 | 67.129 |
| 1184.5286 | 59.492 |
| 1185.2202 | 67.33 |
| 1185.9119 | 61.882 |
| 1186.6035 | 68.906 |
| 1187.2953 | 62.603 |
| 1187.9869 | 65.761 |
| 1188.6786 | 59.045 |
| 1189.3702 | 77.556 |
| 1190.0619 | 78.741 |
| 1190.7535 | 71.574 |
| 1191.4452 | 59.621 |
| 1192.1368 | 56.572 |
| 1192.8285 | 66.362 |
| 1193.5203 | 58.361 |
| 1194.2119 | 61.562 |
| 1194.9036 | 59.674 |
| 1195.5952 | 71.297 |
| 1196.2869 | 70.607 |
| 1196.9785 | 59.731 |
| 1197.6702 | 66.853 |
| 1198.3618 | 79.338 |
| 1199.0535 | 81.523 |
| 1199.7451 | 71.208 |
| 1200.4369 | 68.875 |
| 1201.1285 | 65.893 |
| 1201.8202 | 65.238 |
| 1202.5118 | 65.725 |
| 1203.2035 | 66.841 |
| 1203.8951 | 72.93 |
| 1204.5868 | 67.357 |
| 1205.2784 | 64.762 |
| 1205.9701 | 66.32 |
| 1206.6619 | 66.398 |
| 1207.3535 | 67.25 |
| 1208.0452 | 73.986 |
| 1208.7368 | 64.547 |
| 1209.4285 | 58.424 |
| 1210.1201 | 70.425 |
| 1210.8118 | 62.859 |
| 1211.5034 | 56.179 |
| 1212.1951 | 54.363 |
| 1212.8868 | 55.554 |
| 1213.5785 | 48.992 |
| 1214.2701 | 68.302 |
| 1214.9618 | 63.216 |
| 1215.6534 | 68.817 |
| 1216.3451 | 59.76 |
| 1217.0367 | 59.423 |
| 1217.7284 | 62.538 |
| 1218.42 | 72.576 |
| 1219.1118 | 68.634 |
| 1219.8035 | 58.571 |
| 1220.4951 | 53.027 |
| 1221.1868 | 78.144 |
| 1221.8784 | 63.116 |
| 1222.5701 | 61.024 |
| 1223.2617 | 76.061 |
| 1223.9534 | 54.865 |
| 1224.645 | 54.654 |
| 1225.3368 | 68.736 |
| 1226.0284 | 52.592 |
| 1226.7201 | 47.099 |
| 1227.4117 | 55.554 |
| 1228.1034 | 64.326 |
| 1228.795 | 69.743 |
| 1229.4867 | 71.452 |
| 1230.1783 | 68.799 |
| 1230.87 | 63.713 |
| 1231.5616 | 56.529 |
| 1232.2534 | 60.367 |
| 1232.9451 | 71.045 |
| 1233.6367 | 68.48 |
| 1234.3284 | 68.898 |
| 1235.02 | 61.857 |
| 1235.7117 | 66.548 |
| 1236.4033 | 70.443 |
| 1237.095 | 68.711 |
| 1237.7866 | 61.311 |
| 1238.4784 | 48.565 |
| 1239.17 | 57.193 |
| 1239.8617 | 65.795 |
| 1240.5533 | 63.183 |
| 1241.245 | 67.673 |
| 1241.9366 | 53.593 |
| 1242.6283 | 56.129 |
| 1243.3199 | 61.924 |
| 1244.0116 | 60.175 |
| 1244.7034 | 64.174 |
| 1245.395 | 66.81 |
| 1246.0867 | 78.089 |
| 1246.7783 | 68.28 |
| 1247.47 | 62.964 |
| 1248.1616 | 54.535 |
| 1248.8533 | 69.183 |
| 1249.5449 | 62.041 |
| 1250.2366 | 71.094 |
| 1250.9283 | 65.711 |
| 1251.62 | 69.149 |
| 1252.3116 | 62.729 |
| 1253.0033 | 68.196 |
| 1253.6949 | 64.91 |
| 1254.3866 | 64.37 |
| 1255.0782 | 63.144 |
| 1255.7699 | 61.654 |
| 1256.4615 | 71.667 |
| 1257.1532 | 58.471 |
| 1257.845 | 53.47 |
| 1258.5366 | 62.868 |
| 1259.2283 | 66.807 |
| 1259.9199 | 58.729 |
| 1260.6116 | 58.451 |
| 1261.3032 | 67.872 |
| 1261.9949 | 70.252 |
| 1262.6865 | 60.969 |
| 1263.3782 | 55.359 |
| 1264.0699 | 64.825 |
| 1264.7616 | 70.178 |
| 1265.4532 | 71.571 |
| 1266.1449 | 70.884 |
| 1266.8365 | 64.711 |
| 1267.5282 | 72.355 |
| 1268.2198 | 60.493 |
| 1268.9115 | 64.979 |
| 1269.6031 | 76.976 |
| 1270.2949 | 53.61 |
| 1270.9866 | 74.462 |
| 1271.6782 | 55.782 |
| 1272.3699 | 69 |
| 1273.0615 | 67.522 |
| 1273.7532 | 65.322 |
| 1274.4448 | 69.362 |
| 1275.1365 | 55.38 |
| 1275.8281 | 64.121 |
| 1276.5199 | 63.58 |
| 1277.2115 | 63.108 |
| 1277.9032 | 57.585 |
| 1278.5948 | 66.359 |
| 1279.2865 | 62.925 |
| 1279.9781 | 60.497 |
| 1280.6698 | 62.67 |
| 1281.3615 | 67.9 |
| 1282.0531 | 65.653 |
| 1282.7449 | 56.047 |
| 1283.4365 | 53.678 |
| 1284.1282 | 69.418 |
| 1284.8198 | 63.112 |
| 1285.5115 | 61.6 |
| 1286.2031 | 72.686 |
| 1286.8948 | 67.246 |
| 1287.5864 | 65.776 |
| 1288.2781 | 66.891 |
| 1288.9697 | 51.221 |
| 1289.6615 | 56.747 |
| 1290.3531 | 64.364 |
| 1291.0448 | 59.625 |
| 1291.7365 | 62.115 |
| 1292.4281 | 72.135 |
| 1293.1198 | 60.428 |
| 1293.8114 | 57.73 |
| 1294.5031 | 66.138 |
| 1295.1947 | 62.858 |
| 1295.8865 | 66.956 |
| 1296.5781 | 62.473 |
| 1297.2698 | 66.074 |
| 1297.9614 | 68.447 |
| 1298.6531 | 61.483 |
| 1299.3447 | 61.266 |
| 1300.0364 | 60.55 |
| 1300.728 | 60.957 |
| 1301.4197 | 69.283 |
| 1302.1115 | 48.897 |
| 1302.8031 | 66.198 |
| 1303.4948 | 58.699 |
| 1304.1864 | 58.601 |
| 1304.8781 | 65.705 |
| 1305.5697 | 50.745 |
| 1306.2614 | 51.755 |
| 1306.953 | 52.585 |
| 1307.6447 | 59.628 |
| 1308.3364 | 61.607 |
| 1309.0281 | 51.69 |
| 1309.7197 | 60.516 |
| 1310.4114 | 64.705 |
| 1311.103 | 62.316 |
| 1311.7947 | 58.523 |
| 1312.4863 | 56.476 |
| 1313.178 | 57.538 |
| 1313.8696 | 56.164 |
| 1314.5613 | 57.267 |
| 1315.2531 | 59.957 |
| 1315.9447 | 66.415 |
| 1316.6364 | 59.815 |
| 1317.328 | 58.379 |
| 1318.0197 | 63.599 |
| 1318.7113 | 59.039 |
| 1319.403 | 55.167 |
| 1320.0946 | 55.648 |
| 1320.7863 | 61.433 |
| 1321.478 | 67.954 |
| 1322.1697 | 69.243 |
| 1322.8613 | 50.834 |
| 1323.553 | 61.855 |
| 1324.2446 | 55.035 |
| 1324.9363 | 60 |
| 1325.6279 | 62.839 |
| 1326.3196 | 65.868 |
| 1327.0112 | 53.488 |
| 1327.703 | 57.561 |
| 1328.3947 | 61.489 |
| 1329.0863 | 57.325 |
| 1329.778 | 56 |
| 1330.4696 | 61.278 |
| 1331.1613 | 62.142 |
| 1331.8529 | 50.766 |
| 1332.5446 | 55.722 |
| 1333.2362 | 55.13 |
| 1333.928 | 60.357 |
| 1334.6196 | 59.138 |
| 1335.3113 | 58.979 |
| 1336.0029 | 59 |
| 1336.6946 | 52.679 |
| 1337.3862 | 47.771 |
| 1338.0779 | 63.893 |
| 1338.7695 | 63.31 |
| 1339.4612 | 63.162 |
| 1340.153 | 56.944 |
| 1340.8446 | 53.73 |
| 1341.5363 | 45.691 |
| 1342.2279 | 57.143 |
| 1342.9196 | 53.379 |
| 1343.6112 | 47.873 |
| 1344.3029 | 53.897 |
| 1344.9945 | 59 |
| 1345.6862 | 63.518 |
| 1346.3778 | 54.879 |
| 1347.0696 | 50.555 |
| 1347.7612 | 52.537 |
| 1348.4529 | 50.464 |
| 1349.1445 | 40.152 |
| 1349.8362 | 50.356 |
| 1350.5278 | 52.993 |
| 1351.2195 | 42.716 |
| 1351.9111 | 57.173 |
| 1352.6028 | 56.092 |
| 1353.2946 | 42.206 |
| 1353.9862 | 46.496 |
| 1354.6779 | 47.735 |
| 1355.3695 | 53.289 |
| 1356.0612 | 49.965 |
| 1356.7528 | 52.046 |
| 1357.4445 | 56.848 |
| 1358.1361 | 47.44 |
| 1358.8278 | 53.304 |
| 1359.5195 | 58.997 |
| 1360.2112 | 58.721 |
| 1360.9028 | 55.131 |
| 1361.5945 | 50.696 |
| 1362.2861 | 55.275 |
| 1362.9778 | 45.741 |
| 1363.6694 | 49.931 |
| 1364.3611 | 55.797 |
| 1365.0527 | 49.725 |
| 1365.7445 | 42.238 |
| 1366.4362 | 53.582 |
| 1367.1278 | 44.756 |
| 1367.8195 | 53.278 |
| 1368.5111 | 48.833 |
| 1369.2028 | 52.939 |
| 1369.8944 | 57.889 |
| 1370.5861 | 52.62 |
| 1371.2777 | 34.357 |
| 1371.9694 | 37.933 |
| 1372.6611 | 53.042 |
| 1373.3528 | 53.201 |
| 1374.0444 | 56.815 |
| 1374.7361 | 51.993 |
| 1375.4277 | 47.344 |
| 1376.1194 | 49.909 |
| 1376.811 | 58.699 |
| 1377.5027 | 56.59 |
| 1378.1943 | 50.719 |
| 1378.8861 | 44.889 |
| 1379.5778 | 48.714 |
| 1380.2694 | 42.145 |
| 1380.9611 | 55.797 |
| 1381.6527 | 51.916 |
| 1382.3444 | 55.519 |
| 1383.036 | 45.293 |
| 1383.7277 | 43.314 |
| 1384.4193 | 58.791 |
| 1385.1111 | 55.986 |
| 1385.8027 | 58.909 |
| 1386.4944 | 56.661 |
| 1387.186 | 63.039 |
| 1387.8777 | 42.312 |
| 1388.5693 | 47.739 |
| 1389.261 | 43.281 |
| 1389.9526 | 51.893 |
| 1390.6443 | 54.371 |
| 1391.3361 | 58.141 |
| 1392.0277 | 52.185 |
| 1392.7194 | 52.68 |
| 1393.411 | 41.343 |
| 1394.1027 | 39.827 |
| 1394.7943 | 44.616 |
| 1395.486 | 48 |
| 1396.1776 | 50.449 |
| 1396.8693 | 51.03 |
| 1397.561 | 51.519 |
| 1398.2527 | 45.899 |
| 1398.9443 | 46.707 |
| 1399.636 | 60.262 |
| 1400.3276 | 47.538 |
| 1401.0193 | 49.756 |
| 1401.7109 | 46.706 |
| 1402.4026 | 40.646 |
| 1403.0942 | 51.747 |
| 1403.7859 | 51.002 |
| 1404.4777 | 55.292 |
| 1405.1693 | 56.468 |
| 1405.861 | 49.033 |
| 1406.5526 | 48.142 |
| 1407.2443 | 49.901 |
| 1407.9359 | 42.247 |
| 1408.6276 | 53.04 |
| 1409.3192 | 52.941 |
| 1410.0109 | 48.09 |
| 1410.7026 | 53.598 |
| 1411.3943 | 56.053 |
| 1412.0859 | 54.281 |
| 1412.7776 | 59.425 |
| 1413.4692 | 49.25 |
| 1414.1609 | 47.398 |
| 1414.8525 | 52.639 |
| 1415.5442 | 52.404 |
| 1416.2358 | 54.268 |
| 1416.9276 | 51.43 |
| 1417.6193 | 53.809 |
| 1418.3109 | 49.762 |
| 1419.0026 | 57.588 |
| 1419.6942 | 56.462 |
| 1420.3859 | 62.748 |
| 1421.0775 | 58.441 |
| 1421.7692 | 57.387 |
| 1422.4608 | 47.189 |
| 1423.1526 | 51.9 |
| 1423.8442 | 53.013 |
| 1424.5359 | 57.357 |
| 1425.2275 | 52.335 |
| 1425.9192 | 53.488 |
| 1426.6108 | 54.244 |
| 1427.3025 | 51.872 |
| 1427.9941 | 58.712 |
| 1428.6858 | 56.858 |
| 1429.3776 | 53.288 |
| 1430.0692 | 55.13 |
| 1430.7609 | 50.19 |
| 1431.4525 | 49.51 |
| 1432.1442 | 58.014 |
| 1432.8358 | 49.042 |
| 1433.5275 | 58.753 |
| 1434.2191 | 55.955 |
| 1434.9108 | 50.298 |
| 1435.6024 | 47.994 |
| 1436.2942 | 45.09 |
| 1436.9858 | 50.604 |
| 1437.6775 | 52.118 |
| 1438.3691 | 51.491 |
| 1439.0608 | 57.422 |
| 1439.7524 | 58.322 |
| 1440.4441 | 58.303 |
| 1441.1357 | 63.043 |
| 1441.8274 | 57.999 |
| 1442.5192 | 55.351 |
| 1443.2108 | 58.838 |
| 1443.9025 | 57.899 |
| 1444.5941 | 59.804 |
| 1445.2858 | 54.906 |
| 1445.9774 | 67.488 |
| 1446.6691 | 53.28 |
| 1447.3607 | 56.444 |
| 1448.0524 | 57.168 |
| 1448.7441 | 55.616 |
| 1449.4358 | 59.09 |
| 1450.1274 | 63.526 |
| 1450.8191 | 64.032 |
| 1451.5107 | 46.711 |
| 1452.2024 | 51.131 |
| 1452.894 | 60.36 |
| 1453.5857 | 64.983 |
| 1454.2773 | 66.77 |
| 1454.9691 | 65.433 |
| 1455.6608 | 48.767 |
| 1456.3524 | 72.003 |
| 1457.0441 | 53.249 |
| 1457.7357 | 58.498 |
| 1458.4274 | 65.994 |
| 1459.119 | 59.04 |
| 1459.8107 | 57.429 |
| 1460.5023 | 65.984 |
| 1461.194 | 58.713 |
| 1461.8857 | 60.647 |
| 1462.5774 | 65.456 |
| 1463.269 | 59.092 |
| 1463.9607 | 49.248 |
| 1464.6523 | 60.703 |
| 1465.344 | 60.818 |
| 1466.0356 | 60.166 |
| 1466.7273 | 59.44 |
| 1467.4189 | 61.941 |
| 1468.1107 | 52.836 |
| 1468.8024 | 62.45 |
| 1469.494 | 61.79 |
| 1470.1857 | 57.505 |
| 1470.8773 | 57.385 |
| 1471.569 | 63.563 |
| 1472.2606 | 53.197 |
| 1472.9523 | 50.164 |
| 1473.6439 | 54.958 |
| 1474.3357 | 61.522 |
| 1475.0273 | 61.022 |
| 1475.719 | 66.33 |
| 1476.4106 | 45.249 |
| 1477.1023 | 37.262 |
| 1477.7939 | 40.647 |
| 1478.4856 | 62.669 |
| 1479.1772 | 59.649 |
| 1479.8689 | 54.328 |
| 1480.5607 | 61.08 |
| 1481.2523 | 60.628 |
| 1481.944 | 56.549 |
| 1482.6356 | 62.505 |
| 1483.3273 | 61.661 |
| 1484.0189 | 59.416 |
| 1484.7106 | 61.878 |
| 1485.4022 | 39.357 |
| 1486.0939 | 54.495 |
| 1486.7856 | 56.763 |
| 1487.4773 | 54.445 |
| 1488.1689 | 54.923 |
| 1488.8606 | 60.814 |
| 1489.5522 | 61.192 |
| 1490.2439 | 55.893 |
| 1490.9355 | 63.796 |
| 1491.6272 | 57.961 |
| 1492.3188 | 62.44 |
| 1493.0105 | 42.768 |
| 1493.7023 | 57.054 |
| 1494.3939 | 51.08 |
| 1495.0856 | 54.901 |
| 1495.7772 | 67.006 |
| 1496.4689 | 58.603 |
| 1497.1605 | 53.091 |
| 1497.8522 | 55.971 |
| 1498.5438 | 66.007 |
| 1499.2355 | 66.826 |
| 1499.9272 | 62.265 |
| 1500.6189 | 60.005 |
| 1501.3105 | 64.072 |
| 1502.0022 | 52.874 |
| 1502.6938 | 53.946 |
| 1503.3855 | 48.826 |
| 1504.0771 | 43.174 |
| 1504.7688 | 60.613 |
| 1505.4604 | 43.963 |
| 1506.1522 | 61.189 |
| 1506.8439 | 66.027 |
| 1507.5355 | 48.649 |
| 1508.2272 | 48.62 |
| 1508.9188 | 55.524 |
| 1509.6105 | 53.846 |
| 1510.3021 | 59.71 |
| 1510.9938 | 58.039 |
| 1511.6854 | 57.903 |
| 1512.3772 | 60.737 |
| 1513.0688 | 70.763 |
| 1513.7605 | 64.782 |
| 1514.4521 | 60.732 |
| 1515.1438 | 56.663 |
| 1515.8354 | 51.34 |
| 1516.5271 | 55.365 |
| 1517.2188 | 51.597 |
| 1517.9104 | 57.564 |
| 1518.6021 | 61.611 |
| 1519.2938 | 61.239 |
| 1519.9855 | 64.722 |
| 1520.6771 | 65.528 |
| 1521.3688 | 64.101 |
| 1522.0604 | 72.374 |
| 1522.7521 | 65.676 |
| 1523.4437 | 61.928 |
| 1524.1354 | 60.092 |
| 1524.827 | 61.666 |
| 1525.5188 | 60.769 |
| 1526.2104 | 53.491 |
| 1526.9021 | 57.746 |
| 1527.5938 | 66.66 |
| 1528.2854 | 68.484 |
| 1528.9771 | 61.59 |
| 1529.6687 | 56.781 |
| 1530.3604 | 66.873 |
| 1531.052 | 58.89 |
| 1531.7438 | 57.445 |
| 1532.4354 | 57.916 |
| 1533.1271 | 60.895 |
| 1533.8187 | 57.172 |
| 1534.5104 | 43.605 |
| 1535.202 | 49.337 |
| 1535.8937 | 59.41 |
| 1536.5853 | 59.531 |
| 1537.277 | 56.909 |
| 1537.9688 | 58.25 |
| 1538.6604 | 32.791 |
| 1539.3521 | 64.071 |
| 1540.0437 | 65.155 |
| 1540.7354 | 63.949 |
| 1541.427 | 62.619 |
| 1542.1187 | 70.179 |
| 1542.8103 | 60.294 |
| 1543.502 | 60.783 |
| 1544.1937 | 56.669 |
| 1544.8854 | 53.61 |
| 1545.577 | 57.338 |
| 1546.2687 | 51.049 |
| 1546.9603 | 53.442 |
| 1547.652 | 52.542 |
| 1548.3436 | 47.901 |
| 1549.0353 | 48.505 |
| 1549.7269 | 57.261 |
| 1550.4186 | 62.941 |
| 1551.1104 | 62.212 |
| 1551.802 | 61.063 |
| 1552.4937 | 62.582 |
| 1553.1853 | 61.425 |
| 1553.877 | 61.801 |
| 1554.5686 | 57.626 |
| 1555.2603 | 65.614 |
| 1555.9519 | 50.217 |
| 1556.6436 | 55.771 |
| 1557.3353 | 50.624 |
| 1558.027 | 52.854 |
| 1558.7186 | 44.518 |
| 1559.4103 | 55.586 |
| 1560.1019 | 60.318 |
| 1560.7936 | 58.198 |
| 1561.4852 | 59.287 |
| 1562.1769 | 57.582 |
| 1562.8685 | 50.445 |
| 1563.5603 | 50.726 |
| 1564.252 | 54.086 |
| 1564.9436 | 57.867 |
| 1565.6353 | 54.759 |
| 1566.3269 | 52 |
| 1567.0186 | 58.398 |
| 1567.7102 | 56.662 |
| 1568.4019 | 61.462 |
| 1569.0935 | 58.632 |
| 1569.7853 | 63.89 |
| 1570.4769 | 59.301 |
| 1571.1686 | 47.015 |
| 1571.8602 | 51.892 |
| 1572.5519 | 54.012 |
| 1573.2435 | 55.549 |
| 1573.9352 | 45.832 |
| 1574.6268 | 42.88 |
| 1575.3185 | 49.462 |
| 1576.0103 | 39.734 |
| 1576.7019 | 52.09 |
| 1577.3936 | 63.795 |
| 1578.0852 | 54.466 |
| 1578.7769 | 55.673 |
| 1579.4685 | 58.683 |
| 1580.1602 | 57.92 |
| 1580.8518 | 51.277 |
| 1581.5435 | 58.788 |
| 1582.2351 | 56.445 |
| 1582.9269 | 59.137 |
| 1583.6185 | 67.001 |
| 1584.3102 | 55.618 |
| 1585.0018 | 58.742 |
| 1585.6935 | 64.361 |
| 1586.3851 | 44.714 |
| 1587.0768 | 52.398 |
| 1587.7684 | 42.342 |
| 1588.4601 | 43.879 |
| 1589.1519 | 53.57 |
| 1589.8435 | 54.938 |
| 1590.5352 | 60.004 |
| 1591.2268 | 60.473 |
| 1591.9185 | 55.489 |
| 1592.6101 | 48.456 |
| 1593.3018 | 60.124 |
| 1593.9934 | 58.6 |
| 1594.6851 | 63.158 |
| 1595.3768 | 59.356 |
| 1596.0685 | 63.401 |
| 1596.7601 | 61.316 |
| 1597.4518 | 54.971 |
| 1598.1434 | 52.573 |
| 1598.8351 | 39.458 |
| 1599.5267 | 51.89 |
| 1600.2184 | 45.082 |
| 1600.91 | 55.785 |
| 1601.6018 | 60.113 |
| 1602.2935 | 60.641 |
| 1602.9851 | 60.099 |
| 1603.6768 | 54.061 |
| 1604.3684 | 54.529 |
| 1605.0601 | 36.46 |
| 1605.7517 | 49.703 |
| 1606.4434 | 60.987 |
| 1607.135 | 46.026 |
| 1607.8267 | 59.866 |
| 1608.5184 | 63.164 |
| 1609.2101 | 62.056 |
| 1609.9017 | 57.879 |
| 1610.5934 | 59.387 |
| 1611.285 | 64.658 |
| 1611.9767 | 61.482 |
| 1612.6683 | 57.326 |
| 1613.36 | 46.692 |
| 1614.0516 | 45.764 |
| 1614.7434 | 54.061 |
| 1615.4351 | 54.338 |
| 1616.1267 | 54.34 |
| 1616.8184 | 53.874 |
| 1617.51 | 54.07 |
| 1618.2017 | 54.802 |
| 1618.8933 | 52.626 |
| 1619.585 | 70.145 |
| 1620.2766 | 52.594 |
| 1620.9684 | 59.374 |
| 1621.66 | 57.312 |
| 1622.3517 | 51.813 |
| 1623.0433 | 51.788 |
| 1623.735 | 60.903 |
| 1624.4266 | 48.304 |
| 1625.1183 | 50.904 |
| 1625.8099 | 55.912 |
| 1626.5016 | 51.098 |
| 1627.1934 | 52.931 |
| 1627.885 | 58.835 |
| 1628.5767 | 54.236 |
| 1629.2683 | 59.908 |
| 1629.96 | 50.301 |
| 1630.6516 | 59.025 |
| 1631.3433 | 50.873 |
| 1632.0349 | 49.145 |
| 1632.7266 | 53.108 |
| 1633.4183 | 48.046 |
| 1634.11 | 55.391 |
| 1634.8016 | 51.091 |
| 1635.4933 | 48.792 |
| 1636.1849 | 49.489 |
| 1636.8766 | 47.143 |
| 1637.5682 | 37.89 |
| 1638.2599 | 46.282 |
| 1638.9515 | 52.191 |
| 1639.6432 | 64.771 |
| 1640.335 | 53.942 |
| 1641.0266 | 59.238 |
| 1641.7183 | 55.214 |
| 1642.4099 | 49.727 |
| 1643.1016 | 52.389 |
| 1643.7932 | 56.215 |
| 1644.4849 | 51.841 |
| 1645.1765 | 54.124 |
| 1645.8682 | 59.714 |
| 1646.5599 | 64.142 |
| 1647.2516 | 50.542 |
| 1647.9432 | 53.866 |
| 1648.6349 | 54.71 |
| 1649.3265 | 51.939 |
| 1650.0182 | 49.736 |
| 1650.7098 | 52.307 |
| 1651.4015 | 48.716 |
| 1652.0931 | 60.487 |
| 1652.7849 | 49.222 |
| 1653.4766 | 43.476 |
| 1654.1682 | 46.74 |
| 1654.8599 | 45.427 |
| 1655.5515 | 54.114 |
| 1656.2432 | 48.01 |
| 1656.9348 | 49.667 |
| 1657.6265 | 42.118 |
| 1658.3181 | 39.445 |
| 1659.0099 | 56.268 |
| 1659.7015 | 49.479 |
| 1660.3932 | 47.825 |
| 1661.0848 | 51.532 |
| 1661.7765 | 53.116 |
| 1662.4681 | 50.245 |
| 1663.1598 | 49.647 |
| 1663.8514 | 37.554 |
| 1664.5431 | 38.948 |
| 1665.2347 | 47.638 |
| 1665.9265 | 49.441 |
| 1666.6182 | 43.636 |
| 1667.3098 | 41.636 |
| 1668.0015 | 55.002 |
| 1668.6931 | 51.673 |
| 1669.3848 | 53.016 |
| 1670.0764 | 52.115 |
| 1670.7681 | 51.313 |
| 1671.4597 | 57.675 |
| 1672.1515 | 51.412 |
| 1672.8431 | 47.686 |
| 1673.5348 | 45.208 |
| 1674.2264 | 47.253 |
| 1674.9181 | 51.515 |
| 1675.6097 | 53.337 |
| 1676.3014 | 45.059 |
| 1676.993 | 49.316 |
| 1677.6847 | 48.683 |
| 1678.3765 | 44.269 |
| 1679.0681 | 40.651 |
| 1679.7598 | 47.975 |
| 1680.4514 | 50.796 |
| 1681.1431 | 49.04 |
| 1681.8347 | 52.602 |
| 1682.5264 | 53.812 |
| 1683.218 | 45.709 |
| 1683.9097 | 45.402 |
| 1684.6014 | 49.782 |
| 1685.2931 | 51.425 |
| 1685.9847 | 42.758 |
| 1686.6764 | 50.726 |
| 1687.368 | 50.671 |
| 1688.0597 | 42.2 |
| 1688.7513 | 40.991 |
| 1689.443 | 51.233 |
| 1690.1346 | 41.468 |
| 1690.8264 | 44.694 |
| 1691.5181 | 47.547 |
| 1692.2097 | 56.039 |
| 1692.9014 | 60.434 |
| 1693.593 | 50.678 |
| 1694.2847 | 41.42 |
| 1694.9763 | 49.355 |
| 1695.668 | 49.122 |
| 1696.3596 | 46.04 |
| 1697.0513 | 58.206 |
| 1697.743 | 49.831 |
| 1698.4347 | 46.315 |
| 1699.1263 | 47.018 |
| 1699.818 | 53.619 |
| 1700.5096 | 57.797 |
| 1701.2013 | 50.31 |
| 1701.8929 | 51.116 |
| 1702.5846 | 54.626 |
| 1703.2762 | 46.181 |
| 1703.968 | 46.598 |
| 1704.6597 | 51.977 |
| 1705.3513 | 47.04 |
| 1706.043 | 52.45 |
| 1706.7346 | 42.13 |
| 1707.4263 | 45.93 |
| 1708.1179 | 52.725 |
| 1708.8096 | 54.641 |
| 1709.5012 | 54.503 |
| 1710.193 | 56.919 |
| 1710.8846 | 52.413 |
| 1711.5763 | 52.591 |
| 1712.2679 | 45.125 |
| 1712.9596 | 39.595 |
| 1713.6512 | 48.041 |
| 1714.3429 | 53.103 |
| 1715.0345 | 49.325 |
| 1715.7262 | 52.202 |
| 1716.418 | 47.83 |
| 1717.1096 | 54.949 |
| 1717.8013 | 64.846 |
| 1718.4929 | 40.832 |
| 1719.1846 | 45.983 |
| 1719.8762 | 43.204 |
| 1720.5679 | 52.616 |
| 1721.2595 | 45.578 |
| 1721.9512 | 49.84 |
| 1722.6428 | 53.001 |
| 1723.3346 | 48.54 |
| 1724.0262 | 39.487 |
| 1724.7179 | 53.232 |
| 1725.4095 | 54.517 |
| 1726.1012 | 47.717 |
| 1726.7928 | 45.565 |
| 1727.4845 | 40.014 |
| 1728.1761 | 48.09 |
| 1728.8678 | 46.519 |
| 1729.5596 | 50.181 |
| 1730.2512 | 45.811 |
| 1730.9429 | 49.446 |
| 1731.6345 | 41.856 |
| 1732.3262 | 43.302 |
| 1733.0178 | 50.2 |
| 1733.7095 | 46.738 |
| 1734.4011 | 49.784 |
| 1735.0928 | 48.521 |
| 1735.7845 | 54.908 |
| 1736.4762 | 46.841 |
| 1737.1678 | 38.823 |
| 1737.8595 | 47.121 |
| 1738.5511 | 49.234 |
| 1739.2428 | 41.337 |
| 1739.9344 | 46.784 |
| 1740.6261 | 58.849 |
| 1741.3177 | 51.358 |
| 1742.0095 | 38.759 |
| 1742.7012 | 50.286 |
| 1743.3928 | 50.936 |
| 1744.0845 | 51.975 |
| 1744.7761 | 52.344 |
| 1745.4678 | 53.784 |
| 1746.1594 | 53.227 |
| 1746.8511 | 43.899 |
| 1747.5427 | 46.037 |
| 1748.2345 | 43.946 |
| 1748.9261 | 48.176 |
| 1749.6178 | 46.562 |
| 1750.3094 | 47.47 |
| 1751.0011 | 44.286 |
| 1751.6927 | 49.179 |
| 1752.3844 | 48.729 |
| 1753.076 | 58.19 |
| 1753.7677 | 45.367 |
| 1754.4594 | 44.522 |
| 1755.1511 | 46.872 |
| 1755.8428 | 43.871 |
| 1756.5344 | 45.973 |
| 1757.2261 | 42.832 |
| 1757.9177 | 37.935 |
| 1758.6094 | 42.648 |
| 1759.301 | 50.131 |
| 1759.9927 | 44.366 |
| 1760.6843 | 38.946 |
| 1761.3761 | 48.539 |
| 1762.0677 | 47.024 |
| 1762.7594 | 46.232 |
| 1763.451 | 42.288 |
| 1764.1427 | 52.293 |
| 1764.8344 | 44.138 |
| 1765.526 | 40.414 |
| 1766.2177 | 49.077 |
| 1766.9093 | 44.477 |
| 1767.6011 | 43.675 |
| 1768.2927 | 38.709 |
| 1768.9844 | 42.24 |
| 1769.676 | 41.636 |
| 1770.3677 | 49.199 |
| 1771.0593 | 42.468 |
| 1771.751 | 44.153 |
| 1772.4426 | 44.042 |
| 1773.1343 | 30.217 |
| 1773.826 | 41.494 |
| 1774.5177 | 49.282 |
| 1775.2094 | 51.428 |
| 1775.901 | 47.057 |
| 1776.5927 | 42.859 |
| 1777.2843 | 40.195 |
| 1777.976 | 34.955 |
| 1778.6676 | 45.062 |
| 1779.3593 | 44.66 |
| 1780.051 | 41.277 |
| 1780.7427 | 41.889 |
| 1781.4343 | 45.885 |
| 1782.126 | 37.458 |
| 1782.8176 | 41.992 |
| 1783.5093 | 44.343 |
| 1784.2009 | 38.546 |
| 1784.8926 | 44.951 |
| 1785.5842 | 48.601 |
| 1786.2759 | 34.808 |
| 1786.9677 | 43.12 |
| 1787.6593 | 30.093 |
| 1788.351 | 44.193 |
| 1789.0426 | 45.104 |
| 1789.7343 | 48.526 |
| 1790.4259 | 46.747 |
| 1791.1176 | 48.307 |
| 1791.8092 | 42.79 |
| 1792.5009 | 39.718 |
| 1793.1926 | 42.805 |
| 1793.8843 | 42.675 |
| 1794.5759 | 42.502 |
| 1795.2676 | 45.1 |
| 1795.9592 | 39.071 |
| 1796.6509 | 44.01 |
| 1797.3425 | 33.042 |
| 1798.0342 | 32.001 |
| 1798.7258 | 37.36 |
| 1799.4176 | 25.226 |
| 1800.1093 | 28.69 |
| 1800.8009 | 39.148 |
| 1801.4926 | 31.165 |
| 1802.1842 | 44.484 |
| 1802.8759 | 36.399 |
| 1803.5675 | 45.172 |
| 1804.2592 | 35.387 |
| 1804.9508 | 36.001 |
| 1805.6426 | 44.003 |
| 1806.3342 | 42.212 |
| 1807.0259 | 49.473 |
| 1807.7175 | 28.579 |
| 1808.4092 | 33.558 |
| 1809.1008 | 28.742 |
| 1809.7925 | 32.341 |
| 1810.4841 | 43.079 |
| 1811.1758 | 41.174 |
| 1811.8674 | 36.683 |
| 1812.5592 | 32.085 |
| 1813.2509 | 40.831 |
| 1813.9425 | 38.254 |
| 1814.6342 | 32.056 |
| 1815.3258 | 40.325 |
| 1816.0175 | 47.294 |
| 1816.7091 | 37.923 |
| 1817.4008 | 43.425 |
| 1818.0924 | 37.773 |
| 1818.7842 | 30.69 |
| 1819.4758 | 30.664 |
| 1820.1675 | 41.793 |
| 1820.8591 | 35.466 |
| 1821.5508 | 40.833 |
| 1822.2424 | 28.951 |
| 1822.9341 | 34.803 |
| 1823.6257 | 40.274 |
| 1824.3174 | 47.181 |
| 1825.0092 | 28.87 |
| 1825.7008 | 38.948 |
| 1826.3925 | 35.989 |
| 1827.0841 | 32.085 |
| 1827.7758 | 40.8 |
| 1828.4674 | 40.673 |
| 1829.1591 | 46.225 |
| 1829.8507 | 41.024 |
| 1830.5424 | 30.216 |
| 1831.2341 | 30.385 |
| 1831.9258 | 43.664 |
| 1832.6174 | 38.704 |
| 1833.3091 | 38.244 |
| 1834.0007 | 37.113 |
| 1834.6924 | 43.281 |
| 1835.384 | 29.804 |
| 1836.0757 | 36.886 |
| 1836.7673 | 36.616 |
| 1837.4591 | 43.768 |
| 1838.1508 | 47.26 |
| 1838.8424 | 39.2 |
| 1839.5341 | 32.078 |
| 1840.2257 | 24.142 |
| 1840.9174 | 32.126 |
| 1841.609 | 34.43 |
| 1842.3007 | 43.829 |
| 1842.9923 | 36.486 |
| 1843.684 | 36.294 |
| 1844.3757 | 35.327 |
| 1845.0674 | 32.765 |
| 1845.759 | 42.672 |
| 1846.4507 | 38.186 |
| 1847.1423 | 38.025 |
| 1847.834 | 44.662 |
| 1848.5256 | 34.514 |
| 1849.2173 | 38.684 |
| 1849.9089 | 44.777 |
| 1850.6007 | 39.885 |
| 1851.2924 | 35.92 |
| 1851.984 | 46.544 |
| 1852.6757 | 40.45 |
| 1853.3673 | 44.582 |
| 1854.059 | 34.529 |
| 1854.7506 | 38.368 |
| 1855.4423 | 31.452 |
| 1856.1339 | 40.472 |
| 1856.8257 | 34.414 |
| 1857.5173 | 37.551 |
| 1858.209 | 28.195 |
| 1858.9006 | 36.848 |
| 1859.5923 | 42.264 |
| 1860.2839 | 36.669 |
| 1860.9756 | 25.058 |
| 1861.6672 | 40.06 |
| 1862.3589 | 38.115 |
| 1863.0507 | 33.955 |
| 1863.7423 | 30.549 |
| 1864.434 | 33.659 |
| 1865.1256 | 43.285 |
| 1865.8173 | 27.534 |
| 1866.5089 | 44.676 |
| 1867.2006 | 39.802 |
| 1867.8922 | 32.995 |
| 1868.5839 | 30.673 |
| 1869.2755 | 33.876 |
| 1869.9673 | 29.197 |
| 1870.6589 | 43.585 |
| 1871.3506 | 33.374 |
| 1872.0422 | 42.502 |
| 1872.7339 | 38.303 |
| 1873.4255 | 33.117 |
| 1874.1172 | 29.287 |
| 1874.8088 | 39.906 |
| 1875.5005 | 29.207 |
| 1876.1923 | 33.132 |
| 1876.8839 | 35.284 |
| 1877.5756 | 35.276 |
| 1878.2672 | 29.472 |
| 1878.9589 | 36.092 |
| 1879.6505 | 38.8 |
| 1880.3422 | 28.273 |
| 1881.0338 | 34.076 |
| 1881.7255 | 36.047 |
| 1882.4172 | 32.624 |
| 1883.1089 | 38.444 |
| 1883.8005 | 46.329 |
| 1884.4922 | 40.948 |
| 1885.1838 | 44.848 |
| 1885.8755 | 41.376 |
| 1886.5671 | 38.706 |
| 1887.2588 | 42.957 |
| 1887.9504 | 27.249 |
| 1888.6422 | 45.229 |
| 1889.3339 | 43.642 |
| 1890.0255 | 41.67 |
| 1890.7172 | 36.113 |
| 1891.4088 | 38.361 |
| 1892.1005 | 41.445 |
| 1892.7921 | 41.136 |
| 1893.4838 | 38.865 |
| 1894.1754 | 42.429 |
| 1894.8672 | 47 |
| 1895.5588 | 35.171 |
| 1896.2505 | 37.038 |
| 1896.9421 | 38 |
| 1897.6338 | 40.009 |
| 1898.3254 | 41.303 |
| 1899.0171 | 44.743 |
| 1899.7087 | 46.519 |
| 1900.4004 | 51.146 |
| 1901.092 | 43.354 |
| 1901.7838 | 49.201 |
| 1902.4755 | 47.133 |
| 1903.1671 | 43.011 |
| 1903.8588 | 48.265 |
| 1904.5504 | 41.445 |
| 1905.2421 | 40.03 |
| 1905.9337 | 37.402 |
| 1906.6254 | 42.983 |
| 1907.317 | 42.426 |
| 1908.0088 | 41.515 |
| 1908.7004 | 30.203 |
| 1909.3921 | 45.973 |
| 1910.0837 | 37.79 |
| 1910.7754 | 35.636 |
| 1911.467 | 44.295 |
| 1912.1587 | 43.456 |
| 1912.8503 | 41.832 |
| 1913.542 | 28.97 |
| 1914.2338 | 29.134 |
| 1914.9254 | 40.753 |
| 1915.6171 | 46.462 |
| 1916.3087 | 46.69 |
| 1917.0004 | 40.37 |
| 1917.692 | 42.139 |
| 1918.3837 | 46.281 |
| 1919.0753 | 37.51 |
| 1919.767 | 24.071 |
| 1920.4587 | 25.089 |
| 1921.1504 | 38.105 |
| 1921.842 | 42.491 |
| 1922.5337 | 37.557 |
| 1923.2253 | 29.674 |
| 1923.917 | 38.832 |
| 1924.6086 | 42.445 |
| 1925.3003 | 45.927 |
| 1925.9919 | 45.614 |
| 1926.6837 | 45.258 |
| 1927.3754 | 42.855 |
| 1928.067 | 25.897 |
| 1928.7587 | 49.884 |
| 1929.4503 | 26.947 |
| 1930.142 | 11.809 |
| 1930.8336 | 15.35 |
| 1931.5253 | 15.164 |
| 1932.2169 | 29.009 |
| 1932.9086 | 30.017 |
| 1933.6003 | 32.486 |
| 1934.292 | 36.901 |
| 1934.9836 | 24.127 |
| 1935.6753 | 22.016 |
| 1936.3669 | 33.991 |
| 1937.0586 | 20.951 |
| 1937.7502 | 24.547 |
| 1938.4419 | 30.484 |
| 1939.1335 | 32.056 |
| 1939.8253 | 31.562 |
| 1940.517 | 36.762 |
| 1941.2086 | 31.805 |
| 1941.9003 | 33.446 |
| 1942.5919 | 32.104 |
| 1943.2836 | 46.344 |
| 1943.9752 | 28.7 |
| 1944.6669 | 42.418 |
| 1945.3585 | 41.354 |
| 1946.0503 | 37.945 |
| 1946.7419 | 34.678 |
| 1947.4336 | 38.211 |
| 1948.1252 | 25.279 |
| 1948.8169 | 40.889 |
| 1949.5085 | 36.257 |
| 1950.2002 | 34.849 |
| 1950.8918 | 37.359 |
| 1951.5835 | 34.18 |
| 1952.2753 | 40.332 |
| 1952.9669 | 38.898 |
| 1953.6586 | 27.725 |
| 1954.3502 | 33.33 |
| 1955.0419 | 41.072 |
| 1955.7335 | 30.677 |
| 1956.4252 | 22.926 |
| 1957.1168 | 27.917 |
| 1957.8085 | 18.901 |
| 1958.5001 | 29.35 |
| 1959.1919 | 29.028 |
| 1959.8835 | 22.58 |
| 1960.5752 | 33.122 |
| 1961.2668 | 29.39 |
| 1961.9585 | 24.197 |
| 1962.6501 | 32.185 |
| 1963.3418 | 38.438 |
| 1964.0334 | 31.279 |
| 1964.7251 | 30.234 |
| 1965.4169 | 31.16 |
| 1966.1085 | 31.059 |
| 1966.8002 | 28.387 |
| 1967.4918 | 45.342 |
| 1968.1835 | 8.171 |
| 1968.8751 | 36.996 |
| 1969.5668 | 38.417 |
| 1970.2584 | 38.799 |
| 1970.9501 | 33.816 |
| 1971.6418 | 37.333 |
| 1972.3335 | 27.498 |
| 1973.0251 | 31.844 |
| 1973.7168 | 38.206 |
| 1974.4084 | 42.266 |
| 1975.1001 | 47.399 |
| 1975.7917 | 40.557 |
| 1976.4834 | 35.422 |
| 1977.175 | 31.872 |
| 1977.8668 | 34.577 |
| 1978.5585 | 32.665 |
| 1979.2501 | 30.745 |
| 1979.9418 | 35.604 |
| 1980.6334 | 37.701 |
| 1981.3251 | 40.212 |
| 1982.0167 | 39.223 |
| 1982.7084 | 26.037 |
| 1983.4 | 43.142 |
| 1984.0918 | 38.265 |
| 1984.7834 | 40.037 |
| 1985.4751 | 32.531 |
| 1986.1667 | 37.731 |
| 1986.8584 | 30.385 |
| 1987.55 | 30.408 |
| 1988.2417 | 24.015 |
| 1988.9333 | 22.163 |
| 1989.625 | 26.403 |
| 1990.3167 | 26.844 |
| 1991.0084 | 29.634 |
| 1991.7001 | 21.184 |
| 1992.3917 | 36.537 |
| 1993.0834 | 35.5 |
| 1993.775 | 40.982 |
| 1994.4667 | 31.623 |
| 1995.1583 | 36.913 |
| 1995.85 | 34.877 |
| 1996.5416 | 38.633 |
| 1997.2334 | 38.456 |
| 1997.925 | 40.295 |
| 1998.6167 | 34.262 |
| 1999.3083 | 30.452 |
| 2000.0 | 30.694 |